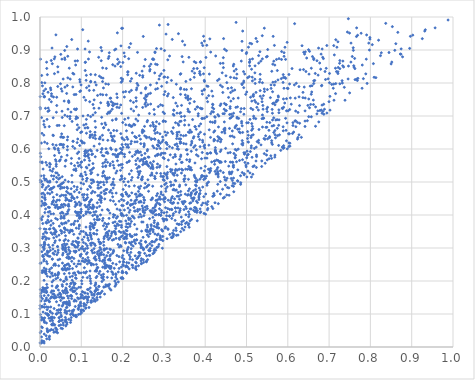
| Category | Series 0 |
|---|---|
| 0.1100741545748205 | 0.863 |
| 0.7561524050366171 | 0.88 |
| 0.2213383729348365 | 0.668 |
| 0.31082736364923436 | 0.566 |
| 0.05881501140073331 | 0.375 |
| 0.2077001341543867 | 0.469 |
| 0.09941343803983782 | 0.35 |
| 0.22474129590128156 | 0.241 |
| 0.0894987563862496 | 0.432 |
| 0.11428210081832157 | 0.461 |
| 0.32411420125168056 | 0.341 |
| 0.4494368115747863 | 0.602 |
| 0.09536818990439033 | 0.39 |
| 0.2600937671301935 | 0.419 |
| 0.07852395329659778 | 0.215 |
| 0.3941471520918871 | 0.913 |
| 0.3291404849244315 | 0.554 |
| 0.09436486856661941 | 0.665 |
| 0.2733584143950506 | 0.393 |
| 0.1052257160090927 | 0.147 |
| 0.02288861726060809 | 0.024 |
| 0.06707291813425464 | 0.637 |
| 0.3591070930105318 | 0.462 |
| 0.06666780943914763 | 0.155 |
| 0.06778112411339321 | 0.252 |
| 0.2748722158852226 | 0.562 |
| 0.3310838847310902 | 0.615 |
| 0.3318929965144153 | 0.457 |
| 0.2477126388382047 | 0.654 |
| 0.5381964580868404 | 0.943 |
| 0.17781520442138432 | 0.442 |
| 0.5909757921056853 | 0.892 |
| 0.7920201085679232 | 0.799 |
| 0.7385241480743844 | 0.748 |
| 0.11983235276188753 | 0.407 |
| 0.21065594822702782 | 0.352 |
| 0.060881231716892414 | 0.548 |
| 0.009716232876056385 | 0.758 |
| 0.31604654172249225 | 0.438 |
| 0.06135613150936381 | 0.09 |
| 0.1420657162447042 | 0.878 |
| 0.07551168304070432 | 0.48 |
| 0.2188223352079094 | 0.389 |
| 0.33605689649653636 | 0.672 |
| 0.14952287533325237 | 0.599 |
| 0.02309779512255772 | 0.033 |
| 0.8531947620428807 | 0.971 |
| 0.4792575335751018 | 0.502 |
| 0.3159996106679521 | 0.538 |
| 0.6005604851256033 | 0.783 |
| 0.47308720654351777 | 0.668 |
| 0.5228959210837767 | 0.935 |
| 0.4465650705564559 | 0.738 |
| 0.053762233356189126 | 0.124 |
| 0.07399551900357404 | 0.173 |
| 0.23739341022596705 | 0.514 |
| 0.568996805573417 | 0.582 |
| 0.01069423835793637 | 0.759 |
| 0.06035654664035961 | 0.235 |
| 0.17217413523768677 | 0.337 |
| 0.14523132341892298 | 0.317 |
| 0.49076377622362677 | 0.957 |
| 0.08273669467874911 | 0.765 |
| 0.015587371564667052 | 0.148 |
| 0.6525093754042111 | 0.725 |
| 0.04582628905373576 | 0.127 |
| 0.17189366761087765 | 0.245 |
| 0.06028367757846953 | 0.871 |
| 0.46297315807958483 | 0.528 |
| 0.5579046771576871 | 0.756 |
| 0.06540003005969464 | 0.074 |
| 0.36713405126202314 | 0.451 |
| 0.0478295696015727 | 0.08 |
| 0.07532882888513681 | 0.193 |
| 0.11683900330069885 | 0.262 |
| 0.4604868582226377 | 0.639 |
| 0.32355957938067237 | 0.353 |
| 0.6502463645707136 | 0.901 |
| 0.006479523693893263 | 0.395 |
| 0.16439020136098426 | 0.742 |
| 0.041366741785079375 | 0.111 |
| 0.2330998935594648 | 0.255 |
| 0.13855004535495663 | 0.143 |
| 0.1282840695632944 | 0.703 |
| 0.37411915965848697 | 0.423 |
| 0.5772220572884103 | 0.758 |
| 0.18890216964727313 | 0.311 |
| 0.38485767430715845 | 0.447 |
| 0.301617382544072 | 0.44 |
| 0.004858100457132419 | 0.168 |
| 0.23472706481705785 | 0.358 |
| 0.006480270601800675 | 0.086 |
| 0.1756989581873024 | 0.732 |
| 0.7900397834879348 | 0.872 |
| 0.3982229264601924 | 0.645 |
| 0.02855077183409871 | 0.069 |
| 0.06489286589899734 | 0.132 |
| 0.06345272307394045 | 0.376 |
| 0.37696562812458945 | 0.511 |
| 0.4523907403904154 | 0.801 |
| 0.5006412719442461 | 0.773 |
| 0.46800749968885136 | 0.851 |
| 0.03250328421970072 | 0.454 |
| 0.5161220097687583 | 0.643 |
| 0.1295572435642931 | 0.344 |
| 0.043669580052863255 | 0.286 |
| 0.27410458968183204 | 0.355 |
| 0.10637662016686822 | 0.757 |
| 0.6977144675577851 | 0.813 |
| 0.38653303928656646 | 0.629 |
| 0.19308721201018708 | 0.415 |
| 0.550347883560244 | 0.713 |
| 0.35058751373335584 | 0.915 |
| 0.06958736796798826 | 0.743 |
| 0.06937149974268386 | 0.302 |
| 0.4726577700699891 | 0.575 |
| 0.028739821413796163 | 0.434 |
| 0.06279326718668432 | 0.083 |
| 0.15408509092757916 | 0.664 |
| 0.265960096582158 | 0.352 |
| 0.0017444135159826457 | 0.577 |
| 0.36385474008297647 | 0.538 |
| 0.12134730296547214 | 0.339 |
| 0.4080440109054172 | 0.5 |
| 0.2106760058366166 | 0.292 |
| 0.2876465947639527 | 0.62 |
| 0.182821030131451 | 0.432 |
| 0.15362581361473993 | 0.499 |
| 0.0967094701959691 | 0.408 |
| 0.04469792743359702 | 0.596 |
| 0.37662139623100677 | 0.478 |
| 0.157498970892752 | 0.679 |
| 0.020537508802304316 | 0.488 |
| 0.712697496963027 | 0.885 |
| 0.23250698948425963 | 0.755 |
| 0.29457919484842243 | 0.356 |
| 0.6779533720498256 | 0.717 |
| 0.0036828761258113074 | 0.031 |
| 0.8745109953242072 | 0.903 |
| 0.004353847302404623 | 0.801 |
| 0.2888647622006305 | 0.434 |
| 0.040922162487327274 | 0.462 |
| 0.16441239013436637 | 0.587 |
| 0.24378213488791511 | 0.441 |
| 0.10947649951936478 | 0.838 |
| 0.25810704071102053 | 0.276 |
| 0.1115141281354779 | 0.425 |
| 0.008950573860700306 | 0.082 |
| 0.13293101221492976 | 0.169 |
| 0.0885428015474733 | 0.176 |
| 0.3319809298994284 | 0.639 |
| 0.35125574784215097 | 0.364 |
| 0.08949458157244639 | 0.434 |
| 0.23677791673108506 | 0.685 |
| 0.1780356338276572 | 0.509 |
| 0.762518998744183 | 0.844 |
| 0.6750677041381641 | 0.682 |
| 0.3761127106289186 | 0.721 |
| 0.08419635822444016 | 0.602 |
| 0.0868368542497231 | 0.691 |
| 0.09726463142179043 | 0.279 |
| 0.29703100353059797 | 0.351 |
| 0.21551195347099938 | 0.672 |
| 0.07234918369407883 | 0.463 |
| 0.30803865688706855 | 0.614 |
| 0.5967271826457968 | 0.625 |
| 0.1407700352191994 | 0.49 |
| 0.32258353494054615 | 0.574 |
| 0.6651730564934099 | 0.808 |
| 0.3517928914092684 | 0.764 |
| 0.1816602128645486 | 0.184 |
| 0.2296685080790556 | 0.583 |
| 0.09449974077980572 | 0.294 |
| 0.2766714069636026 | 0.366 |
| 0.004505472962964441 | 0.019 |
| 0.7112510562920555 | 0.797 |
| 0.053624582656293995 | 0.613 |
| 0.0429893669696344 | 0.217 |
| 0.12808767409357424 | 0.43 |
| 0.01732960971104147 | 0.278 |
| 0.16170496553257974 | 0.277 |
| 0.04151704353548846 | 0.183 |
| 0.7530878419614998 | 0.921 |
| 0.551112135616497 | 0.631 |
| 0.49864947625384093 | 0.551 |
| 0.34754329155292196 | 0.64 |
| 0.003740885011056183 | 0.464 |
| 0.7697729882105951 | 0.814 |
| 0.307345536864577 | 0.523 |
| 0.4756595513655947 | 0.672 |
| 0.24471708252873325 | 0.322 |
| 0.013563800192890607 | 0.781 |
| 0.6026672765176194 | 0.618 |
| 0.5631681289763388 | 0.774 |
| 0.23831258400169242 | 0.274 |
| 0.22681183460676424 | 0.715 |
| 0.436245949551351 | 0.732 |
| 0.12116682230491926 | 0.366 |
| 0.12511485793077903 | 0.421 |
| 0.12271605653081996 | 0.698 |
| 0.009386136792113198 | 0.685 |
| 0.5981010519724457 | 0.679 |
| 0.06481699195612278 | 0.19 |
| 0.06853239545998857 | 0.322 |
| 0.5741503546143323 | 0.689 |
| 0.13468688579390875 | 0.19 |
| 0.06333188737560558 | 0.402 |
| 0.051497954840776905 | 0.782 |
| 0.19606553814048733 | 0.912 |
| 0.16470394215265793 | 0.338 |
| 0.052513074315030384 | 0.351 |
| 0.4677422031651026 | 0.548 |
| 0.2717401302300192 | 0.319 |
| 0.03282528835269516 | 0.36 |
| 0.05003871738589727 | 0.141 |
| 0.37269681494846807 | 0.637 |
| 0.23623413791657166 | 0.595 |
| 0.2735065212190322 | 0.405 |
| 0.5042001215957855 | 0.68 |
| 0.10913676898128988 | 0.903 |
| 0.19640825114028349 | 0.334 |
| 0.46290792346199094 | 0.511 |
| 0.25923875335337354 | 0.427 |
| 0.07953143068511304 | 0.829 |
| 0.014846156111684383 | 0.034 |
| 0.2636741426281569 | 0.491 |
| 0.4239769158148209 | 0.532 |
| 0.017182885981332774 | 0.055 |
| 0.16563773481280175 | 0.373 |
| 0.06140904214902754 | 0.173 |
| 0.027201983603159285 | 0.868 |
| 0.3430625991278782 | 0.539 |
| 0.3828857282450634 | 0.579 |
| 0.0002288454370822368 | 0.012 |
| 0.05994901947746145 | 0.876 |
| 0.07684575884237377 | 0.154 |
| 0.03420333206057369 | 0.117 |
| 0.5202880348131336 | 0.812 |
| 0.061920203584229117 | 0.377 |
| 0.17486568743311948 | 0.626 |
| 0.41770728844451777 | 0.681 |
| 0.4781490764428097 | 0.728 |
| 0.3817742200452954 | 0.727 |
| 0.10736024236123909 | 0.291 |
| 0.131611777189108 | 0.386 |
| 0.44794720459118265 | 0.658 |
| 0.11576016820506119 | 0.33 |
| 0.18448345014136935 | 0.577 |
| 0.05481410435278289 | 0.279 |
| 0.13325980961978778 | 0.269 |
| 0.044963383678046864 | 0.509 |
| 0.06522228596865765 | 0.12 |
| 0.7960903821757862 | 0.921 |
| 0.22366046342711998 | 0.578 |
| 0.12365383205557201 | 0.507 |
| 0.18374912455762316 | 0.903 |
| 0.05149458832351217 | 0.151 |
| 0.38603867588358165 | 0.463 |
| 0.04349889925415884 | 0.423 |
| 0.5034660668223253 | 0.533 |
| 0.10824581693810087 | 0.592 |
| 0.7460311614944646 | 0.812 |
| 0.45522743165821833 | 0.588 |
| 0.3783571378190601 | 0.42 |
| 0.13032902753382858 | 0.409 |
| 0.0414854225537864 | 0.527 |
| 0.2974152038998784 | 0.389 |
| 0.5005398874218442 | 0.679 |
| 0.6627469821935159 | 0.871 |
| 0.33220132715919526 | 0.601 |
| 0.13809127377802166 | 0.386 |
| 0.40889133138435696 | 0.612 |
| 0.03105660466861704 | 0.16 |
| 0.2671863989159129 | 0.558 |
| 0.261247874868617 | 0.507 |
| 0.153531096465638 | 0.264 |
| 0.045213332667328854 | 0.222 |
| 0.11095327006446787 | 0.119 |
| 0.5639190679559897 | 0.802 |
| 0.28412710258379503 | 0.612 |
| 0.19269778702813123 | 0.586 |
| 0.15880554725636187 | 0.513 |
| 0.35524844966996894 | 0.377 |
| 0.14278984440684994 | 0.724 |
| 0.05233647672937014 | 0.637 |
| 0.060794783592021284 | 0.08 |
| 0.26304623115594705 | 0.335 |
| 0.12121815301932448 | 0.23 |
| 0.277858499911103 | 0.517 |
| 0.3422385064205339 | 0.698 |
| 0.10509330561178765 | 0.317 |
| 0.47587781021500175 | 0.561 |
| 0.7161088600685399 | 0.798 |
| 0.15951153847136545 | 0.567 |
| 0.2665099587690626 | 0.292 |
| 0.018547795295711045 | 0.466 |
| 0.20094631343780844 | 0.208 |
| 0.6869217931407494 | 0.736 |
| 0.37198042713566937 | 0.414 |
| 0.1569923957350321 | 0.56 |
| 0.07764097383129265 | 0.354 |
| 0.0541289176569254 | 0.082 |
| 0.28944384820635205 | 0.455 |
| 0.2821222905310572 | 0.904 |
| 0.03709940070072548 | 0.217 |
| 0.2529295693891016 | 0.572 |
| 0.2456632977831782 | 0.268 |
| 0.14263347261174308 | 0.277 |
| 0.11001982741993965 | 0.265 |
| 0.07112583732844768 | 0.11 |
| 0.44665782117122355 | 0.454 |
| 0.10381207270427173 | 0.269 |
| 0.06479689727542504 | 0.271 |
| 0.8198251337220566 | 0.93 |
| 0.7213368723338714 | 0.834 |
| 0.06661165681444559 | 0.699 |
| 0.07034592000960715 | 0.444 |
| 0.10603303641792006 | 0.673 |
| 0.0659892234547006 | 0.792 |
| 0.21915699871106686 | 0.429 |
| 0.14572451653514562 | 0.636 |
| 0.023806020817071838 | 0.499 |
| 0.1312014811508989 | 0.269 |
| 0.29700259370132565 | 0.732 |
| 0.47174092991278205 | 0.495 |
| 0.14510595266549564 | 0.312 |
| 0.27911375173457453 | 0.661 |
| 0.23331849903031743 | 0.635 |
| 0.07046332623262153 | 0.27 |
| 0.0756350987642268 | 0.371 |
| 0.21993780398068064 | 0.287 |
| 0.012081082703761847 | 0.506 |
| 0.5725892061892702 | 0.871 |
| 0.15713497360484208 | 0.297 |
| 0.36478108146967825 | 0.458 |
| 0.05624577393217178 | 0.134 |
| 0.04684353124764751 | 0.089 |
| 0.6569705984826502 | 0.845 |
| 0.49108126006336705 | 0.612 |
| 0.05366991972008517 | 0.372 |
| 0.15256186136695726 | 0.628 |
| 0.06935656479033714 | 0.274 |
| 0.17503995468639943 | 0.324 |
| 0.033815773649937264 | 0.358 |
| 0.1836256767965796 | 0.222 |
| 0.02263741684539522 | 0.75 |
| 0.34999137232050104 | 0.699 |
| 0.06976956473226603 | 0.741 |
| 0.039074844008831544 | 0.562 |
| 0.12522883897346837 | 0.528 |
| 0.07765550839167257 | 0.499 |
| 0.17278466646964885 | 0.599 |
| 0.48720490789893856 | 0.722 |
| 0.4244296863544267 | 0.595 |
| 0.22619068472923876 | 0.434 |
| 0.21917553181524696 | 0.336 |
| 0.09392675653732063 | 0.181 |
| 0.005446581545453744 | 0.231 |
| 0.18465397311519272 | 0.25 |
| 0.2447294316493147 | 0.261 |
| 0.17411153571982885 | 0.348 |
| 0.27775521646238266 | 0.831 |
| 0.7798534476119054 | 0.784 |
| 0.5302579960834105 | 0.659 |
| 0.39838075977109344 | 0.693 |
| 0.7254133776865678 | 0.86 |
| 0.18779279771144175 | 0.395 |
| 0.34090630311211867 | 0.828 |
| 0.15951875391514592 | 0.188 |
| 0.19857870074607897 | 0.225 |
| 0.11754417905471204 | 0.174 |
| 0.3753447646414806 | 0.41 |
| 0.5848610479898283 | 0.871 |
| 0.1686235480188264 | 0.469 |
| 0.2816395982158548 | 0.401 |
| 0.25103238890555934 | 0.453 |
| 0.037025970577972744 | 0.322 |
| 0.006961342333167031 | 0.767 |
| 0.19228959040283056 | 0.863 |
| 0.19628848033594137 | 0.305 |
| 0.1985381698207358 | 0.598 |
| 0.24998629702980235 | 0.562 |
| 0.48975886891213294 | 0.529 |
| 0.011606841351060715 | 0.334 |
| 0.21360796442581897 | 0.501 |
| 0.3323118166595015 | 0.521 |
| 0.26947705176378134 | 0.543 |
| 0.4724011035296456 | 0.573 |
| 0.2932093942930548 | 0.463 |
| 0.6930278385628218 | 0.844 |
| 0.08226165779343497 | 0.29 |
| 0.014773164910350078 | 0.223 |
| 0.040837523884774685 | 0.28 |
| 0.24253598867500958 | 0.402 |
| 0.3317737555625282 | 0.709 |
| 0.46917483937739013 | 0.857 |
| 0.12239048117113394 | 0.375 |
| 0.09530297065169047 | 0.398 |
| 0.451111287839173 | 0.734 |
| 0.26046590333698094 | 0.598 |
| 0.369470529663516 | 0.689 |
| 0.2919231322129804 | 0.734 |
| 0.169011615894338 | 0.297 |
| 0.030999074676923755 | 0.482 |
| 0.054410757220343164 | 0.254 |
| 0.267728536356711 | 0.52 |
| 0.212355798424823 | 0.362 |
| 0.08203013278158255 | 0.268 |
| 0.05612309771465751 | 0.425 |
| 0.08633676154198833 | 0.854 |
| 0.18629306908183785 | 0.206 |
| 0.20438006508676798 | 0.415 |
| 0.06492005781925803 | 0.911 |
| 0.03841962590829351 | 0.056 |
| 0.3383275528951758 | 0.708 |
| 0.02342546158810699 | 0.235 |
| 0.5046327879315242 | 0.621 |
| 0.1320402115037812 | 0.312 |
| 0.19799049554475057 | 0.509 |
| 0.19072249526777996 | 0.551 |
| 0.6189942723599008 | 0.685 |
| 0.1228160386434527 | 0.826 |
| 0.00765670082573211 | 0.175 |
| 0.15924876776378327 | 0.797 |
| 0.370207549149152 | 0.443 |
| 0.1228320955635982 | 0.805 |
| 0.27732409510307954 | 0.319 |
| 0.01349702974075584 | 0.418 |
| 0.2385936949042472 | 0.485 |
| 0.3094801793211671 | 0.359 |
| 0.17073209867238626 | 0.279 |
| 0.08971841584733609 | 0.398 |
| 0.21496216725078954 | 0.562 |
| 0.07661454514015209 | 0.147 |
| 0.44409033891438054 | 0.847 |
| 0.5370420723863024 | 0.564 |
| 0.1972553174107876 | 0.519 |
| 0.06631278108614413 | 0.597 |
| 0.20312546938423692 | 0.266 |
| 0.1286734546613577 | 0.368 |
| 0.2851072133269914 | 0.375 |
| 0.11947718956166786 | 0.777 |
| 0.18631741006069547 | 0.726 |
| 0.05333347777561459 | 0.715 |
| 0.6018907392313807 | 0.646 |
| 0.17177079270217144 | 0.241 |
| 0.7261090641455563 | 0.798 |
| 0.3939193236562474 | 0.485 |
| 0.03608175372473843 | 0.879 |
| 0.2206689494104177 | 0.721 |
| 0.12270853977553842 | 0.484 |
| 0.18810694178039922 | 0.576 |
| 0.350921606117669 | 0.51 |
| 0.1999130545318989 | 0.966 |
| 0.3810634142971525 | 0.413 |
| 0.4046190463038548 | 0.496 |
| 0.42103224286315677 | 0.624 |
| 0.35055199150893823 | 0.687 |
| 0.05975531682543522 | 0.358 |
| 0.06897501206532186 | 0.128 |
| 0.45030709411736114 | 0.822 |
| 0.4405448560379617 | 0.651 |
| 0.5119500137532038 | 0.515 |
| 0.01755907455954453 | 0.101 |
| 0.7022110170608604 | 0.718 |
| 0.511695118145562 | 0.61 |
| 0.1762713316810356 | 0.561 |
| 0.2778964497489258 | 0.423 |
| 0.6367793220179805 | 0.772 |
| 0.7497190854627658 | 0.77 |
| 0.2983039135765502 | 0.574 |
| 0.43551337930282763 | 0.559 |
| 0.07799376406533154 | 0.457 |
| 0.0071477935702188855 | 0.121 |
| 0.44375326797528847 | 0.529 |
| 0.5005476806607955 | 0.573 |
| 0.0591762246645251 | 0.348 |
| 0.039210935108962675 | 0.349 |
| 0.5002991186581397 | 0.893 |
| 0.2098901171345381 | 0.223 |
| 0.3026128377645845 | 0.36 |
| 0.272853650102882 | 0.487 |
| 0.08719144277241841 | 0.096 |
| 0.28280099572426876 | 0.302 |
| 0.03456284517605568 | 0.346 |
| 0.32473803527943 | 0.52 |
| 0.5376470932657437 | 0.743 |
| 0.16973085334809013 | 0.754 |
| 0.6734016740933456 | 0.824 |
| 0.20912368101548862 | 0.335 |
| 0.21236344785465944 | 0.629 |
| 0.15359989932610218 | 0.368 |
| 0.2282282340874705 | 0.391 |
| 0.32265697540379834 | 0.705 |
| 0.3187499768344535 | 0.451 |
| 0.05556699578002322 | 0.295 |
| 0.2388295426609538 | 0.547 |
| 0.46569382091266 | 0.655 |
| 0.4426607904473949 | 0.771 |
| 0.008007336213363692 | 0.231 |
| 0.508360886944527 | 0.92 |
| 0.08178149719101879 | 0.113 |
| 0.5138679569943835 | 0.818 |
| 0.2693934041855991 | 0.359 |
| 0.03364662661064155 | 0.045 |
| 0.6704648235020516 | 0.706 |
| 0.3480035619940779 | 0.616 |
| 0.006061824148834938 | 0.015 |
| 0.12607972943562384 | 0.373 |
| 0.5384346795833865 | 0.873 |
| 0.8450414274719726 | 0.892 |
| 0.20776939918810378 | 0.382 |
| 0.18375517031311006 | 0.527 |
| 0.09502520066436393 | 0.367 |
| 0.18453701676330891 | 0.366 |
| 0.8950217557644518 | 0.905 |
| 0.3024650029410001 | 0.453 |
| 0.4039935729847477 | 0.791 |
| 0.11742694907897555 | 0.323 |
| 0.23349596334388756 | 0.341 |
| 0.12157933423838674 | 0.179 |
| 0.055214151852808424 | 0.305 |
| 0.08818578865249127 | 0.244 |
| 0.280309522903078 | 0.293 |
| 0.3285415779164751 | 0.41 |
| 0.2584245956861344 | 0.76 |
| 0.2685354328808881 | 0.857 |
| 0.13930344810732975 | 0.288 |
| 0.5066052101483809 | 0.819 |
| 0.13028013258912163 | 0.778 |
| 0.07980435110789463 | 0.624 |
| 0.1520432990870333 | 0.764 |
| 0.3604128763207336 | 0.374 |
| 0.21289948072695208 | 0.834 |
| 0.016364639982488383 | 0.122 |
| 0.2304925622182633 | 0.276 |
| 0.039441839241605714 | 0.554 |
| 0.3619477102806167 | 0.562 |
| 0.40421309078660594 | 0.572 |
| 0.17694553666428348 | 0.377 |
| 0.3483552320986064 | 0.354 |
| 0.009536955733526753 | 0.178 |
| 0.2914038055756124 | 0.331 |
| 0.2735951615037726 | 0.42 |
| 0.09005390047473938 | 0.659 |
| 0.5471185035382068 | 0.666 |
| 0.22755442987154495 | 0.423 |
| 0.3042018834048624 | 0.364 |
| 0.36182808772012376 | 0.479 |
| 0.10505376150726842 | 0.398 |
| 0.46638155325971054 | 0.616 |
| 0.08707124988831894 | 0.765 |
| 0.19905418659674656 | 0.586 |
| 0.9026267437423124 | 0.945 |
| 0.27873417550228463 | 0.4 |
| 0.3976349367908243 | 0.846 |
| 0.24408775658643078 | 0.616 |
| 0.17474281545998904 | 0.466 |
| 0.11039130660916607 | 0.596 |
| 0.15492843784339672 | 0.492 |
| 0.38763148731732755 | 0.607 |
| 0.011824908730888817 | 0.437 |
| 0.13368035099707498 | 0.308 |
| 0.026238738435517273 | 0.369 |
| 0.2720891998862882 | 0.549 |
| 0.024013789859349655 | 0.274 |
| 0.20465649331818658 | 0.577 |
| 0.18409339990144258 | 0.689 |
| 0.7213461104044561 | 0.925 |
| 0.20309565745339797 | 0.444 |
| 0.29867074140251837 | 0.447 |
| 0.11518192266851357 | 0.453 |
| 0.1640498259898734 | 0.229 |
| 0.17099624335444163 | 0.603 |
| 0.03420507802812367 | 0.281 |
| 0.7009898598821939 | 0.801 |
| 0.07631451253843935 | 0.102 |
| 0.0948989808602273 | 0.439 |
| 0.0687583048642667 | 0.501 |
| 0.3634964272773683 | 0.419 |
| 0.476765050364263 | 0.827 |
| 0.44641495564242983 | 0.654 |
| 0.33307287231471594 | 0.608 |
| 0.12342863882175847 | 0.333 |
| 0.2780948026304515 | 0.511 |
| 0.0239697996933097 | 0.503 |
| 0.20144193744813776 | 0.478 |
| 0.010824800265701318 | 0.315 |
| 0.4590316798530807 | 0.525 |
| 0.022263484846513304 | 0.138 |
| 0.45123966299539353 | 0.716 |
| 0.26658770560625145 | 0.841 |
| 0.2084392240651448 | 0.226 |
| 0.29393921612863216 | 0.487 |
| 0.11617530920417518 | 0.702 |
| 0.17662161461148962 | 0.5 |
| 0.20241510129396945 | 0.398 |
| 0.12728108845891373 | 0.506 |
| 0.05891367960608451 | 0.222 |
| 0.2109669868750884 | 0.34 |
| 0.12194624710788537 | 0.314 |
| 0.11799549130162679 | 0.258 |
| 0.5015461748806977 | 0.593 |
| 0.13288941314515545 | 0.186 |
| 0.0496271467419418 | 0.48 |
| 0.12061728497171054 | 0.44 |
| 0.2571414313272459 | 0.56 |
| 0.3394060658597803 | 0.617 |
| 0.6671529990649658 | 0.669 |
| 0.15528223731034663 | 0.333 |
| 0.7213922376992067 | 0.829 |
| 0.4481609763564781 | 0.507 |
| 0.3214974390884867 | 0.647 |
| 0.03755731135845353 | 0.248 |
| 0.16528672492216268 | 0.732 |
| 0.6269820820545291 | 0.789 |
| 0.28753324590242635 | 0.401 |
| 0.21912458827864056 | 0.746 |
| 0.0032142277166684607 | 0.122 |
| 0.014488429095489308 | 0.326 |
| 0.3712430798146703 | 0.633 |
| 0.0037097832874838366 | 0.502 |
| 0.05878026916270829 | 0.245 |
| 0.0753291931428205 | 0.156 |
| 0.4468157687576627 | 0.902 |
| 0.2904161305125669 | 0.646 |
| 0.072001694248929 | 0.183 |
| 0.1329268271397095 | 0.641 |
| 0.33272574570162616 | 0.536 |
| 0.8967671629510696 | 0.941 |
| 0.10803287417298568 | 0.58 |
| 0.19862460751287914 | 0.403 |
| 0.6727571730196529 | 0.715 |
| 0.04670050122967395 | 0.078 |
| 0.19862712826001983 | 0.613 |
| 0.41843339292917814 | 0.457 |
| 0.1560901627534359 | 0.252 |
| 0.32397532431765896 | 0.478 |
| 0.04093463908722317 | 0.184 |
| 0.015002982892587502 | 0.236 |
| 0.017640928554685797 | 0.252 |
| 0.46777463325032453 | 0.496 |
| 0.2984382556088332 | 0.587 |
| 0.6424113680576362 | 0.894 |
| 0.26046389054781416 | 0.265 |
| 0.5758224393336652 | 0.748 |
| 0.1151129872360358 | 0.299 |
| 0.047816061177669233 | 0.163 |
| 0.30894055779876617 | 0.529 |
| 0.04752899671487243 | 0.49 |
| 0.17493947867835014 | 0.721 |
| 0.35032351073433754 | 0.519 |
| 0.03237754830830841 | 0.641 |
| 0.3760048969041496 | 0.463 |
| 0.05640765106963175 | 0.392 |
| 0.41601682888860725 | 0.775 |
| 0.2065877369463872 | 0.317 |
| 0.06781249788676502 | 0.131 |
| 0.09937896733739404 | 0.559 |
| 0.06446834309550986 | 0.129 |
| 0.40973403465675373 | 0.658 |
| 0.5889881054253623 | 0.825 |
| 0.07115528874957044 | 0.134 |
| 0.35874567162474125 | 0.714 |
| 0.11679863082772768 | 0.927 |
| 0.08239592880061863 | 0.188 |
| 0.4058460369168927 | 0.586 |
| 0.2076343424428332 | 0.243 |
| 0.5293810072720788 | 0.626 |
| 0.08764114530198042 | 0.432 |
| 0.1145208990089972 | 0.21 |
| 0.5896066105807218 | 0.817 |
| 0.19852520699939857 | 0.634 |
| 0.6344795230474017 | 0.913 |
| 0.0008494192323126315 | 0.721 |
| 0.23854938447235696 | 0.246 |
| 0.26129763630861835 | 0.734 |
| 0.08636099495540805 | 0.32 |
| 0.29760849707132286 | 0.322 |
| 0.5186256083586105 | 0.549 |
| 0.31428019861431045 | 0.341 |
| 0.02248178509745924 | 0.668 |
| 0.048382520915236316 | 0.512 |
| 0.766679061300919 | 0.967 |
| 0.4293370300709669 | 0.472 |
| 0.31012221651892113 | 0.977 |
| 0.162173419925697 | 0.247 |
| 0.3026490392814972 | 0.587 |
| 0.3426850566818461 | 0.732 |
| 0.25125117745272774 | 0.297 |
| 0.1975512778377998 | 0.708 |
| 0.5482149847846426 | 0.879 |
| 0.6817202784297544 | 0.792 |
| 0.2665472483692687 | 0.413 |
| 0.1842089397294695 | 0.329 |
| 0.3104098839878294 | 0.445 |
| 0.48488841872405497 | 0.649 |
| 0.25154510312972944 | 0.607 |
| 0.5931167820688079 | 0.908 |
| 0.10014683377975953 | 0.11 |
| 0.4530777172636532 | 0.511 |
| 0.2344363057382437 | 0.785 |
| 0.5958131238510168 | 0.657 |
| 0.05740829359206212 | 0.635 |
| 0.1165269937130965 | 0.58 |
| 0.2697542165217529 | 0.357 |
| 0.6386183017100437 | 0.893 |
| 0.25300448368014294 | 0.754 |
| 0.14341067097657823 | 0.269 |
| 0.025966951465642873 | 0.087 |
| 0.5929692886551607 | 0.817 |
| 0.35716531636458804 | 0.538 |
| 0.005724323934753195 | 0.059 |
| 0.4696835809435188 | 0.586 |
| 0.8664035237631265 | 0.953 |
| 0.16649588103124646 | 0.735 |
| 0.0680114581004796 | 0.13 |
| 0.39233241279341713 | 0.776 |
| 0.470145096172089 | 0.636 |
| 0.03382810188423846 | 0.518 |
| 0.19744372603837668 | 0.208 |
| 0.5484898709937606 | 0.582 |
| 0.04790282344527097 | 0.266 |
| 0.5713515986362045 | 0.742 |
| 0.03117592747382647 | 0.308 |
| 0.21061791527674367 | 0.434 |
| 0.06149810370780573 | 0.291 |
| 0.5630825564695265 | 0.688 |
| 0.009287265882333195 | 0.081 |
| 0.4607954799644619 | 0.56 |
| 0.20068375315023113 | 0.862 |
| 0.24452780206234526 | 0.301 |
| 0.8502061810240755 | 0.858 |
| 0.0851135805289216 | 0.426 |
| 0.4017790214695971 | 0.877 |
| 0.2402421188205457 | 0.64 |
| 0.05606128364052787 | 0.302 |
| 0.33775141233008754 | 0.448 |
| 0.42064346227060967 | 0.722 |
| 0.49666359609828103 | 0.588 |
| 0.3599438282563896 | 0.395 |
| 0.38872711973954355 | 0.865 |
| 0.3851004274203911 | 0.67 |
| 0.4156722912697971 | 0.561 |
| 0.24791341793348243 | 0.516 |
| 0.2990380417662054 | 0.686 |
| 0.24879952994651644 | 0.818 |
| 0.47991946862227364 | 0.754 |
| 0.23610259105331854 | 0.893 |
| 0.0466899133902936 | 0.151 |
| 0.02968608492039415 | 0.267 |
| 0.010235473704145348 | 0.299 |
| 0.3571047756143716 | 0.46 |
| 0.5635953223484897 | 0.857 |
| 0.44165628517126665 | 0.788 |
| 0.26729979907082757 | 0.794 |
| 0.09944179510784912 | 0.794 |
| 0.3281888260082425 | 0.68 |
| 0.21195561495584603 | 0.297 |
| 0.2561489909745934 | 0.318 |
| 0.05313560879019885 | 0.872 |
| 0.7908513967836414 | 0.946 |
| 0.6829930331157781 | 0.708 |
| 0.28418389310560144 | 0.581 |
| 0.1478254561698199 | 0.438 |
| 0.31000910714653895 | 0.356 |
| 0.009286028355143361 | 0.642 |
| 0.09170488255019837 | 0.331 |
| 0.11499945179136806 | 0.665 |
| 0.11472178308462222 | 0.579 |
| 0.17991663492339827 | 0.491 |
| 0.541005045130744 | 0.694 |
| 0.16290081821327995 | 0.333 |
| 0.5559786701950316 | 0.637 |
| 0.22851789603889416 | 0.489 |
| 0.2106533006537421 | 0.606 |
| 0.25546245455138783 | 0.782 |
| 0.2764945400261982 | 0.377 |
| 0.5210401494354214 | 0.799 |
| 0.04620308940206663 | 0.672 |
| 0.3751077248378286 | 0.668 |
| 0.7989340193278179 | 0.933 |
| 0.10894866877121256 | 0.586 |
| 0.07249569984585558 | 0.35 |
| 0.246458283392467 | 0.379 |
| 0.36337119341310264 | 0.657 |
| 0.15482252649873185 | 0.182 |
| 0.23926448134069445 | 0.394 |
| 0.31907701153696943 | 0.39 |
| 0.04206938816038008 | 0.185 |
| 0.2364862724165654 | 0.411 |
| 0.12179858482228034 | 0.535 |
| 0.3080692847466857 | 0.511 |
| 0.04655136226228562 | 0.589 |
| 0.3667674784775615 | 0.651 |
| 0.3580275105109273 | 0.721 |
| 0.04505209854724246 | 0.521 |
| 0.43178466685284644 | 0.434 |
| 0.48573465569353647 | 0.493 |
| 0.31917814790716625 | 0.416 |
| 0.0962225474215107 | 0.81 |
| 0.2579480850986814 | 0.303 |
| 0.4432067898215477 | 0.86 |
| 0.35307067186290964 | 0.491 |
| 0.01960468709599006 | 0.099 |
| 0.5787680617352378 | 0.874 |
| 0.061260790574262036 | 0.295 |
| 0.5731606104708713 | 0.745 |
| 0.5767470961926031 | 0.761 |
| 0.6829101055068161 | 0.733 |
| 0.19659386340417084 | 0.814 |
| 0.1673327423134553 | 0.39 |
| 0.23744506605633575 | 0.793 |
| 0.3356328625646924 | 0.371 |
| 0.10744698647726636 | 0.24 |
| 0.027973242496056372 | 0.24 |
| 0.47158424873355276 | 0.779 |
| 0.20958403944461124 | 0.399 |
| 0.14903142238465972 | 0.287 |
| 0.08899200027805654 | 0.477 |
| 0.027769520758882726 | 0.152 |
| 0.03457387138216561 | 0.873 |
| 0.5207147977959534 | 0.852 |
| 0.16288276266555468 | 0.513 |
| 0.21780938288096763 | 0.266 |
| 0.10099232928023039 | 0.561 |
| 0.31601783977855835 | 0.5 |
| 0.05058178824388093 | 0.39 |
| 0.3653032173091664 | 0.437 |
| 0.23255297271884257 | 0.244 |
| 0.34411664263666786 | 0.44 |
| 0.6822565768718559 | 0.793 |
| 0.07951303274990862 | 0.168 |
| 0.1282534178018393 | 0.556 |
| 0.3666738217653046 | 0.783 |
| 0.12313777372107504 | 0.136 |
| 0.043681553757937364 | 0.264 |
| 0.33416069086477596 | 0.339 |
| 0.16167165235173042 | 0.298 |
| 0.3939428506447189 | 0.692 |
| 0.5415030897690771 | 0.693 |
| 0.042550126023564006 | 0.043 |
| 0.14772683114543672 | 0.444 |
| 0.7976534232709224 | 0.9 |
| 0.11423121902060673 | 0.511 |
| 0.6050883123491166 | 0.618 |
| 0.02267586667128685 | 0.357 |
| 0.2753353493931321 | 0.668 |
| 0.1816760785904472 | 0.379 |
| 0.05073036293498834 | 0.614 |
| 0.08332505401249035 | 0.471 |
| 0.6407132642170198 | 0.888 |
| 0.7690414860906251 | 0.945 |
| 0.6173731872268883 | 0.685 |
| 0.08694533767944412 | 0.719 |
| 0.017838404610493463 | 0.825 |
| 0.2083656460773995 | 0.364 |
| 0.069355949385842 | 0.746 |
| 0.2548774932876521 | 0.496 |
| 0.3621100418972544 | 0.539 |
| 0.37652592905559257 | 0.491 |
| 0.5250879658749591 | 0.726 |
| 0.2799774535215296 | 0.428 |
| 0.020503153345980518 | 0.309 |
| 0.4599403012041733 | 0.693 |
| 0.2842406928316953 | 0.446 |
| 0.17594673260478633 | 0.455 |
| 0.3911026159365525 | 0.57 |
| 0.5909841262424711 | 0.881 |
| 0.13399118549797417 | 0.825 |
| 0.1027241280261516 | 0.619 |
| 0.777560655750454 | 0.951 |
| 0.5239076171071871 | 0.544 |
| 0.016122138751687665 | 0.375 |
| 9.008500004059616e-05 | 0.116 |
| 0.590734301319884 | 0.784 |
| 0.02353374727276769 | 0.302 |
| 0.5829576244216883 | 0.596 |
| 0.36335839478694176 | 0.382 |
| 0.04705442311233077 | 0.564 |
| 0.7829882713395405 | 0.813 |
| 0.3231623744325177 | 0.404 |
| 0.03258023433795809 | 0.758 |
| 0.17292453669682117 | 0.492 |
| 0.07377603674399369 | 0.098 |
| 0.05232531967602094 | 0.08 |
| 0.5907029406079101 | 0.604 |
| 0.08262544197690835 | 0.487 |
| 0.5258537785145213 | 0.622 |
| 0.23886235496418406 | 0.703 |
| 0.37747258185898025 | 0.862 |
| 0.11225096022652759 | 0.823 |
| 0.46156948564324674 | 0.771 |
| 0.09328568372879764 | 0.099 |
| 0.27422976469530624 | 0.674 |
| 0.22632233816379732 | 0.741 |
| 0.11730178437403871 | 0.873 |
| 0.4337683961388302 | 0.812 |
| 0.030940299418052986 | 0.216 |
| 0.20272554363556639 | 0.501 |
| 0.15697254759250578 | 0.244 |
| 0.5375456994798482 | 0.692 |
| 0.1453183024544441 | 0.631 |
| 0.517602721388831 | 0.693 |
| 0.009421369083785103 | 0.674 |
| 0.2957142364840667 | 0.622 |
| 0.27142706566303654 | 0.521 |
| 0.11895228884026754 | 0.262 |
| 0.0026015784615920357 | 0.389 |
| 0.04490113753072811 | 0.104 |
| 0.11205521230696713 | 0.545 |
| 0.03923933935966528 | 0.548 |
| 0.5968999032031846 | 0.716 |
| 0.018837404184973483 | 0.096 |
| 0.04589861931500139 | 0.339 |
| 0.35916948615071165 | 0.37 |
| 0.33907119346513614 | 0.413 |
| 0.13546224128212236 | 0.41 |
| 0.6873838184811882 | 0.705 |
| 0.3773945725697373 | 0.414 |
| 0.5084607848160199 | 0.69 |
| 0.08180834309177809 | 0.537 |
| 0.20019666447894624 | 0.277 |
| 0.5169200708200683 | 0.766 |
| 0.1627486001196411 | 0.348 |
| 0.2092975419053874 | 0.247 |
| 0.05642501291633162 | 0.605 |
| 0.1990029401689195 | 0.553 |
| 0.1401171046986145 | 0.522 |
| 0.1165953861194412 | 0.595 |
| 0.22260634361776477 | 0.248 |
| 0.020127064887879742 | 0.396 |
| 0.2031746648894831 | 0.345 |
| 0.1658009778977091 | 0.711 |
| 0.05909564460325867 | 0.313 |
| 0.17753838278680056 | 0.394 |
| 0.28635015149263365 | 0.304 |
| 0.3403054021275692 | 0.766 |
| 0.519656278648738 | 0.747 |
| 0.56758292469267 | 0.914 |
| 0.5150560781518029 | 0.662 |
| 0.12210910118867302 | 0.356 |
| 0.3185586414865239 | 0.491 |
| 0.4956730328597897 | 0.827 |
| 0.050074458167364444 | 0.153 |
| 0.2296054605642035 | 0.673 |
| 0.6570057099052995 | 0.698 |
| 0.0602568614436334 | 0.703 |
| 0.16062331921917838 | 0.844 |
| 0.6045954654583825 | 0.72 |
| 0.015960802153271003 | 0.863 |
| 0.3072454531167268 | 0.547 |
| 0.2519838034805161 | 0.851 |
| 0.08401556217774597 | 0.225 |
| 0.09123654334815934 | 0.382 |
| 0.1244114087239111 | 0.136 |
| 0.30402399463099505 | 0.683 |
| 0.6246684910809102 | 0.711 |
| 0.6902232852645687 | 0.835 |
| 0.42263682724573215 | 0.563 |
| 0.28387344128552827 | 0.371 |
| 0.22891916307726234 | 0.412 |
| 0.05104077778934235 | 0.057 |
| 0.09959651925051882 | 0.224 |
| 0.5099086862565215 | 0.757 |
| 0.24465153598462774 | 0.312 |
| 0.12519759557764532 | 0.292 |
| 0.1600604640356984 | 0.345 |
| 0.13880261262338833 | 0.394 |
| 0.05389004069094605 | 0.695 |
| 0.623221024831191 | 0.681 |
| 0.7153512827191538 | 0.845 |
| 0.0900159346555669 | 0.302 |
| 0.10659389290941867 | 0.446 |
| 0.5142038819802905 | 0.669 |
| 0.38674005756727414 | 0.835 |
| 0.22138959965619642 | 0.623 |
| 0.2919549702657688 | 0.448 |
| 0.05266233272258747 | 0.431 |
| 0.2485802969452766 | 0.301 |
| 0.07567013877492335 | 0.444 |
| 0.3135041719247219 | 0.397 |
| 0.032725742778230704 | 0.404 |
| 0.6366667621906541 | 0.756 |
| 0.18504708038443918 | 0.39 |
| 0.30500796972707966 | 0.642 |
| 0.7618554353892989 | 0.874 |
| 0.23211916820684186 | 0.592 |
| 0.13802425511995642 | 0.238 |
| 0.1539900995165394 | 0.532 |
| 0.024695001484973056 | 0.212 |
| 0.12113773213551526 | 0.423 |
| 0.10503884058140223 | 0.453 |
| 0.25457393244741655 | 0.571 |
| 0.18734325552891806 | 0.952 |
| 0.181701101321329 | 0.851 |
| 0.12182566179173393 | 0.638 |
| 0.45657349020217697 | 0.756 |
| 0.5042249698940116 | 0.584 |
| 0.2074439895803396 | 0.774 |
| 0.33972927721782364 | 0.622 |
| 0.4421200246091528 | 0.478 |
| 0.020098264848030234 | 0.157 |
| 0.10893474344737808 | 0.445 |
| 0.09391647761389221 | 0.126 |
| 0.29337512254867537 | 0.325 |
| 0.8133320783421635 | 0.816 |
| 0.14700847237445136 | 0.282 |
| 0.19986972991091823 | 0.812 |
| 0.06112649251235913 | 0.307 |
| 0.5946320086220737 | 0.693 |
| 0.09401032099075923 | 0.399 |
| 0.011314344592757375 | 0.12 |
| 0.4389752839953335 | 0.629 |
| 0.07796820001265459 | 0.11 |
| 0.014818663027496681 | 0.508 |
| 0.21869641311835064 | 0.431 |
| 0.3788946607006888 | 0.442 |
| 0.0847683796350569 | 0.305 |
| 0.0992144440734738 | 0.159 |
| 0.08180995833853033 | 0.341 |
| 0.06441784883074286 | 0.101 |
| 0.257931273409983 | 0.634 |
| 0.2844993845017877 | 0.465 |
| 0.04394760290939481 | 0.601 |
| 0.2596285745867769 | 0.554 |
| 0.5784219022230827 | 0.719 |
| 0.21590497462931746 | 0.908 |
| 0.11454170886880433 | 0.286 |
| 0.24653877231172638 | 0.46 |
| 0.6114747228285319 | 0.647 |
| 0.18071085500076056 | 0.9 |
| 0.46850727513104196 | 0.487 |
| 0.21473157234339102 | 0.874 |
| 0.3205285938016865 | 0.456 |
| 0.2157994140583004 | 0.487 |
| 0.14585819234461572 | 0.151 |
| 0.14754908242900955 | 0.908 |
| 0.1626801391833811 | 0.591 |
| 0.34500217222749374 | 0.927 |
| 0.20846537877982252 | 0.353 |
| 0.39659962632495904 | 0.456 |
| 0.5925697426204064 | 0.739 |
| 0.061843611718964464 | 0.337 |
| 0.11668401455002375 | 0.151 |
| 0.00996002828230047 | 0.266 |
| 0.05529339902105512 | 0.635 |
| 0.09409636419348966 | 0.317 |
| 0.21638295439932742 | 0.564 |
| 0.233462208208029 | 0.779 |
| 0.05143105239074197 | 0.396 |
| 0.27694664239014255 | 0.631 |
| 0.3532059843132407 | 0.805 |
| 0.30955343866187623 | 0.419 |
| 0.6567557941433865 | 0.766 |
| 0.002821029308950118 | 0.255 |
| 0.3544214602557889 | 0.598 |
| 0.0005412835567026875 | 0.759 |
| 0.08040061248937858 | 0.098 |
| 0.17800529027207956 | 0.293 |
| 0.1356667709310626 | 0.232 |
| 0.17648563368775005 | 0.739 |
| 0.5945710356212983 | 0.872 |
| 0.1635309600645959 | 0.56 |
| 0.4223879151799339 | 0.563 |
| 0.6061612546298358 | 0.755 |
| 0.003050832645384749 | 0.082 |
| 0.14761841591807578 | 0.456 |
| 0.27084516026250594 | 0.413 |
| 0.3889863111652796 | 0.676 |
| 0.3829802799754516 | 0.7 |
| 0.362535637022376 | 0.739 |
| 0.37929765039545227 | 0.5 |
| 0.43715962863767355 | 0.622 |
| 0.29684877233222484 | 0.636 |
| 0.33867532489901 | 0.683 |
| 0.11151194812692744 | 0.41 |
| 0.14364730922883517 | 0.387 |
| 0.25528765866891046 | 0.415 |
| 0.12774679379592002 | 0.398 |
| 0.05023691861704327 | 0.636 |
| 0.062382680713404914 | 0.076 |
| 0.43642184731832223 | 0.501 |
| 0.2628810578006666 | 0.472 |
| 0.14527756993775198 | 0.283 |
| 0.0033512792030021554 | 0.618 |
| 0.14931612576973807 | 0.696 |
| 0.1598536877541511 | 0.601 |
| 0.5202905729561323 | 0.831 |
| 0.603781765790765 | 0.646 |
| 0.2578712709245147 | 0.562 |
| 0.1548141009146219 | 0.579 |
| 0.2365326559726152 | 0.591 |
| 0.07680683423685153 | 0.26 |
| 0.06617922470288273 | 0.627 |
| 0.025032625722973267 | 0.553 |
| 0.018729228874015957 | 0.384 |
| 0.33021991125358807 | 0.476 |
| 0.7178843661964466 | 0.835 |
| 0.17790003095486073 | 0.401 |
| 0.011323353707310746 | 0.45 |
| 0.11507390930472317 | 0.338 |
| 0.11144534325305944 | 0.152 |
| 0.41859083791842755 | 0.734 |
| 0.029300831353242462 | 0.224 |
| 0.08211703880987709 | 0.827 |
| 0.8740446521500789 | 0.887 |
| 0.009224414202599451 | 0.776 |
| 0.18123258593109337 | 0.399 |
| 0.431537594765938 | 0.516 |
| 0.0212629111975835 | 0.378 |
| 0.31993477830767514 | 0.331 |
| 0.006728978922465156 | 0.275 |
| 0.39258696898095025 | 0.722 |
| 0.6811665916505888 | 0.718 |
| 0.3271401265110291 | 0.475 |
| 0.0668443583145435 | 0.404 |
| 0.025032436733830488 | 0.293 |
| 0.11437673746196209 | 0.307 |
| 0.5166019253247415 | 0.76 |
| 0.098305377551276 | 0.776 |
| 0.009316225584604765 | 0.311 |
| 0.6851149564880237 | 0.714 |
| 0.08625531710342516 | 0.093 |
| 0.015561391382431733 | 0.073 |
| 0.5430142487160325 | 0.782 |
| 0.7466514840038239 | 0.995 |
| 0.12266455261528009 | 0.803 |
| 0.42610286181825907 | 0.524 |
| 0.2101102154955531 | 0.329 |
| 0.7321702974210677 | 0.8 |
| 0.30763113534046604 | 0.328 |
| 0.010094015407506096 | 0.239 |
| 0.029302503148802006 | 0.185 |
| 0.72600013612965 | 0.843 |
| 0.22104543052163605 | 0.506 |
| 0.19617461364355382 | 0.21 |
| 0.26457518169986427 | 0.291 |
| 0.03140267778688188 | 0.642 |
| 0.30855367110944965 | 0.761 |
| 0.1536361521360744 | 0.221 |
| 0.12353294834243012 | 0.445 |
| 0.42321829380196874 | 0.68 |
| 0.19427191840921287 | 0.507 |
| 0.10346455759901063 | 0.962 |
| 0.2336399045427684 | 0.589 |
| 0.5350926732984415 | 0.612 |
| 0.19488885275818768 | 0.602 |
| 0.16545646114638313 | 0.874 |
| 0.3938279646758144 | 0.519 |
| 0.30519135087661153 | 0.948 |
| 0.27853330684776145 | 0.892 |
| 0.19494037368389527 | 0.535 |
| 0.03940548063297711 | 0.179 |
| 0.41860169015000936 | 0.42 |
| 0.2496398727158733 | 0.568 |
| 0.09964555128741703 | 0.113 |
| 0.4388840423519188 | 0.56 |
| 0.023693777533474236 | 0.411 |
| 0.3440579669769035 | 0.88 |
| 0.1832938649784669 | 0.359 |
| 0.1435217154653129 | 0.631 |
| 0.13783388502925664 | 0.214 |
| 0.19168349515348904 | 0.442 |
| 0.0587390953807041 | 0.361 |
| 0.1468888428934827 | 0.454 |
| 0.3015876520207905 | 0.898 |
| 0.017669259745560773 | 0.29 |
| 0.5984131737514539 | 0.923 |
| 0.11554064264929464 | 0.161 |
| 0.28807844381901415 | 0.311 |
| 0.034945120293471965 | 0.251 |
| 0.02280400185480491 | 0.229 |
| 0.18155635650657864 | 0.583 |
| 0.05457412896592817 | 0.237 |
| 0.15394634656902995 | 0.204 |
| 0.01890246180546218 | 0.098 |
| 0.014490916525750963 | 0.432 |
| 0.061925543359164115 | 0.301 |
| 0.007602227723506605 | 0.017 |
| 0.3721577903177906 | 0.605 |
| 0.05000239867515033 | 0.114 |
| 0.13655019530260581 | 0.25 |
| 0.29735691234038664 | 0.335 |
| 0.3221314497193132 | 0.476 |
| 0.25492919405055214 | 0.424 |
| 0.4621320635289047 | 0.745 |
| 0.021847084916922332 | 0.087 |
| 0.03195046355606457 | 0.052 |
| 0.005953948458255476 | 0.791 |
| 0.22294259986382403 | 0.432 |
| 0.21798553257763864 | 0.366 |
| 0.01642415601683822 | 0.19 |
| 0.00636315179622815 | 0.329 |
| 0.15515279934349258 | 0.297 |
| 0.378675690853839 | 0.598 |
| 0.46538104760096477 | 0.56 |
| 0.31673625774603065 | 0.531 |
| 0.41039239439704056 | 0.528 |
| 0.23908421313321815 | 0.458 |
| 0.4437090822252502 | 0.451 |
| 0.010920430470828135 | 0.758 |
| 0.2823756371295669 | 0.527 |
| 0.3202406046825532 | 0.932 |
| 0.4244666248572635 | 0.597 |
| 0.15100770472238823 | 0.26 |
| 0.0037724027230274793 | 0.695 |
| 0.16054765801742799 | 0.248 |
| 0.3712202344931431 | 0.447 |
| 0.5152820229710118 | 0.719 |
| 0.11209741111983396 | 0.448 |
| 0.1055415293495795 | 0.494 |
| 0.03314002764124635 | 0.17 |
| 0.542546689962858 | 0.632 |
| 0.08472501937430965 | 0.381 |
| 0.23412788691693043 | 0.455 |
| 0.1588832991993686 | 0.547 |
| 0.5385488437898558 | 0.801 |
| 0.04960374309631954 | 0.798 |
| 0.5710698616489083 | 0.688 |
| 0.16301907211614175 | 0.509 |
| 0.2832412012102433 | 0.544 |
| 0.2255471058155878 | 0.306 |
| 0.22316450395655396 | 0.514 |
| 0.39810709010327583 | 0.927 |
| 0.29348234275630747 | 0.828 |
| 0.38769537129269027 | 0.418 |
| 0.26178466344210194 | 0.551 |
| 0.14086314896237506 | 0.162 |
| 0.15465355839435269 | 0.181 |
| 0.366374306063866 | 0.468 |
| 0.17856493933443884 | 0.326 |
| 0.18670054278663162 | 0.418 |
| 0.27258421550511447 | 0.872 |
| 0.4894223089038645 | 0.795 |
| 0.6102842619122356 | 0.844 |
| 0.4503848414507561 | 0.505 |
| 0.05554486186007923 | 0.234 |
| 0.34928557962157225 | 0.781 |
| 0.07129927819730442 | 0.284 |
| 0.12156189874248768 | 0.653 |
| 0.3093763211727406 | 0.87 |
| 0.45510514889569587 | 0.784 |
| 0.3569914364598914 | 0.584 |
| 0.05976134374725772 | 0.36 |
| 0.05711132838932664 | 0.613 |
| 0.11950526289703634 | 0.432 |
| 0.7101292010313498 | 0.784 |
| 0.05686523451387826 | 0.199 |
| 0.549313364339463 | 0.666 |
| 0.13303537578628544 | 0.642 |
| 0.1602736122896583 | 0.589 |
| 0.0650029290858607 | 0.17 |
| 0.17859896182239765 | 0.656 |
| 0.20087300863042634 | 0.226 |
| 0.04768262445053084 | 0.423 |
| 0.006389953767023782 | 0.088 |
| 0.310822289889093 | 0.767 |
| 0.11073414873812049 | 0.117 |
| 0.1812967704610785 | 0.367 |
| 0.03456957463004651 | 0.149 |
| 0.24444243644437091 | 0.439 |
| 0.46848156772348704 | 0.551 |
| 0.03858701156430899 | 0.44 |
| 0.12518583889049895 | 0.252 |
| 0.0068682065954130955 | 0.278 |
| 0.3684263345072485 | 0.836 |
| 0.16553163115302372 | 0.243 |
| 0.05663310197701521 | 0.498 |
| 0.05856156511406296 | 0.483 |
| 0.09343693726546898 | 0.146 |
| 0.42282219651628206 | 0.554 |
| 0.08588357494125887 | 0.41 |
| 0.5447202936389961 | 0.629 |
| 0.154059940868305 | 0.319 |
| 0.03709606761887996 | 0.423 |
| 0.3832871012056681 | 0.707 |
| 0.06920774024837328 | 0.433 |
| 0.10970590597033969 | 0.578 |
| 0.06925069372788129 | 0.236 |
| 0.06279083247815287 | 0.207 |
| 0.6542789768200452 | 0.791 |
| 0.6457120049107286 | 0.876 |
| 0.4873720645032077 | 0.866 |
| 0.028876393354004937 | 0.17 |
| 0.46543986260550796 | 0.489 |
| 0.21644644636522048 | 0.773 |
| 0.06902847621049624 | 0.382 |
| 0.3059355425851037 | 0.387 |
| 0.13334230603872088 | 0.684 |
| 0.000656621838975191 | 0.043 |
| 0.07741863381952707 | 0.272 |
| 0.8591312580730638 | 0.899 |
| 0.18347441098990946 | 0.212 |
| 0.07416982361554658 | 0.192 |
| 0.00824657101307491 | 0.343 |
| 0.08001029444689689 | 0.32 |
| 0.11137205529808669 | 0.363 |
| 0.0697965003328479 | 0.416 |
| 0.21175716614317652 | 0.286 |
| 0.33225403150663557 | 0.644 |
| 0.2760009489990287 | 0.41 |
| 0.3736167827281366 | 0.865 |
| 0.24837917796980657 | 0.658 |
| 0.21997150074373772 | 0.616 |
| 0.12454320673560415 | 0.594 |
| 0.007429640456531161 | 0.106 |
| 0.14950689568090614 | 0.898 |
| 0.009812365843787418 | 0.305 |
| 0.12873097926142807 | 0.635 |
| 0.29831181409862606 | 0.46 |
| 0.8243670849280671 | 0.883 |
| 0.30762794021337636 | 0.515 |
| 0.10237745800090381 | 0.517 |
| 0.002760021663182566 | 0.012 |
| 0.02988720974323411 | 0.266 |
| 0.20716107712322562 | 0.49 |
| 0.34100593335944085 | 0.582 |
| 0.040151830259075316 | 0.335 |
| 0.5035117444543025 | 0.557 |
| 0.2847842426197731 | 0.783 |
| 0.5387321889432598 | 0.667 |
| 0.18147520630357894 | 0.347 |
| 0.10298747155762089 | 0.461 |
| 0.11190918598555954 | 0.341 |
| 0.1535966327439584 | 0.785 |
| 0.1218797614623558 | 0.597 |
| 0.012905210056447958 | 0.178 |
| 0.6083454044912515 | 0.736 |
| 0.2943452005903674 | 0.408 |
| 0.045247795180801464 | 0.246 |
| 0.2489470182088559 | 0.42 |
| 0.5850289317472457 | 0.895 |
| 0.09408748310168069 | 0.359 |
| 0.395931463419702 | 0.828 |
| 0.7468993442700262 | 0.851 |
| 0.08501077574780647 | 0.192 |
| 0.2822284419278993 | 0.459 |
| 0.09252640802628698 | 0.308 |
| 0.11281426991955168 | 0.786 |
| 0.586399222974429 | 0.724 |
| 0.25267974759431244 | 0.612 |
| 0.07792167649873949 | 0.202 |
| 0.13349092604113932 | 0.23 |
| 0.10517702036550891 | 0.149 |
| 0.24371528594047775 | 0.487 |
| 0.3004057397763259 | 0.45 |
| 0.13299764290317762 | 0.401 |
| 0.002833809361788231 | 0.09 |
| 0.01959125681934859 | 0.5 |
| 0.022110860821109246 | 0.03 |
| 0.40656088731881956 | 0.441 |
| 0.061573210426581815 | 0.43 |
| 0.4789425785652015 | 0.537 |
| 0.09927950891327064 | 0.125 |
| 0.43058984362401376 | 0.637 |
| 0.2802201551844975 | 0.668 |
| 0.34112521850739985 | 0.619 |
| 0.29319461208725506 | 0.904 |
| 0.23285152887630634 | 0.463 |
| 0.10280014521778114 | 0.304 |
| 0.3179950469586451 | 0.332 |
| 0.13296077767208303 | 0.469 |
| 0.09840643042007924 | 0.394 |
| 0.004430144847777373 | 0.172 |
| 0.11746376511792644 | 0.152 |
| 0.2270631656552723 | 0.675 |
| 0.04935867136637406 | 0.112 |
| 0.295672780764638 | 0.353 |
| 0.5401321257931033 | 0.721 |
| 0.0587409863790912 | 0.391 |
| 0.49804406907422427 | 0.766 |
| 0.2515691852453694 | 0.437 |
| 0.14645411785520113 | 0.4 |
| 0.047671927034201644 | 0.324 |
| 0.04963885390943801 | 0.405 |
| 0.7803186573049861 | 0.854 |
| 0.049103948532028596 | 0.567 |
| 0.5875025502518965 | 0.723 |
| 0.032739609799088965 | 0.444 |
| 0.25402041595062974 | 0.736 |
| 0.0024161138616909383 | 0.518 |
| 0.024432583632844507 | 0.109 |
| 0.30405813283944827 | 0.422 |
| 0.10663126405912937 | 0.131 |
| 0.05122867833943723 | 0.096 |
| 0.00013171395549438358 | 0.359 |
| 0.2453957983163465 | 0.253 |
| 0.7156490097341959 | 0.768 |
| 0.6417739829517172 | 0.716 |
| 0.3210033038437451 | 0.345 |
| 0.007752952912372102 | 0.466 |
| 0.627170954322907 | 0.643 |
| 0.38949553736456277 | 0.41 |
| 0.48314883111725393 | 0.565 |
| 0.2799874973264136 | 0.781 |
| 0.4304734088550042 | 0.493 |
| 0.13116998705339533 | 0.749 |
| 0.027863541317250884 | 0.767 |
| 0.06659655486505556 | 0.165 |
| 0.09816759756507354 | 0.136 |
| 0.09448723445828977 | 0.224 |
| 0.39684403793063516 | 0.608 |
| 0.13474825375796973 | 0.171 |
| 0.512277991416436 | 0.842 |
| 0.32702568953782984 | 0.613 |
| 0.08770782547639133 | 0.432 |
| 0.43680036706087755 | 0.464 |
| 0.3372366582391765 | 0.539 |
| 0.0607707626159214 | 0.506 |
| 0.10185542427531569 | 0.26 |
| 0.14515914702360366 | 0.161 |
| 0.0806634323862575 | 0.196 |
| 0.4585810640184541 | 0.53 |
| 0.28818627392843876 | 0.812 |
| 0.16929496874479788 | 0.55 |
| 0.3406071738184173 | 0.35 |
| 0.4206704786027251 | 0.651 |
| 0.11478675523844062 | 0.135 |
| 0.005959364851880755 | 0.146 |
| 0.46990167707254815 | 0.816 |
| 0.04043056797390743 | 0.5 |
| 0.28957720069402604 | 0.822 |
| 0.500962390587564 | 0.515 |
| 0.019930900568057797 | 0.409 |
| 0.28819697845164316 | 0.402 |
| 0.3619734687569339 | 0.712 |
| 0.6179675621610907 | 0.754 |
| 0.3654264504922947 | 0.612 |
| 0.5407750791002699 | 0.762 |
| 0.1499616610672646 | 0.198 |
| 0.03164291972936406 | 0.151 |
| 0.5686489164904158 | 0.854 |
| 0.24255989865832084 | 0.285 |
| 0.3012643534408027 | 0.526 |
| 0.2735309208815444 | 0.54 |
| 0.4666486655629444 | 0.699 |
| 0.1281809578601163 | 0.315 |
| 0.10226428548476307 | 0.622 |
| 0.3381668072418782 | 0.491 |
| 0.5593391424299705 | 0.794 |
| 0.4811198141453318 | 0.693 |
| 0.0984388595113802 | 0.65 |
| 0.07618187344198568 | 0.572 |
| 0.13504835950223282 | 0.263 |
| 0.5243828916622446 | 0.577 |
| 0.08157229225684726 | 0.374 |
| 0.10012085425730033 | 0.545 |
| 0.04405062013040506 | 0.488 |
| 0.39315070101844596 | 0.766 |
| 0.32881256829363403 | 0.504 |
| 0.25782835111841773 | 0.258 |
| 0.1238726371386133 | 0.139 |
| 0.2183580959170509 | 0.373 |
| 0.052336985943709835 | 0.345 |
| 0.033174775200829565 | 0.248 |
| 0.5547212264239854 | 0.571 |
| 0.17918724872193903 | 0.35 |
| 0.12118144120562713 | 0.361 |
| 0.6862021449415424 | 0.874 |
| 0.04611918495254996 | 0.065 |
| 0.08766555005314114 | 0.139 |
| 0.5505268741140442 | 0.78 |
| 0.11119270068689724 | 0.522 |
| 0.001112883043284274 | 0.56 |
| 0.37523478379304687 | 0.558 |
| 0.3071037095771534 | 0.802 |
| 0.4773035728574905 | 0.693 |
| 0.08254584626725348 | 0.252 |
| 0.015249205724440329 | 0.165 |
| 0.12599285228380763 | 0.292 |
| 0.2893406772186984 | 0.419 |
| 0.566008736709635 | 0.695 |
| 0.16895919712118324 | 0.33 |
| 0.5109207270913414 | 0.635 |
| 0.11110150911492955 | 0.404 |
| 0.11848845612567716 | 0.791 |
| 0.00153380821257465 | 0.308 |
| 0.12144614211113447 | 0.346 |
| 0.25486062365938644 | 0.871 |
| 0.21007850868765254 | 0.636 |
| 0.6627802465449708 | 0.807 |
| 0.16069553756798272 | 0.764 |
| 0.15447412873908983 | 0.308 |
| 0.5626782882760215 | 0.614 |
| 0.2621234471754058 | 0.349 |
| 0.36741027677311167 | 0.623 |
| 0.3792398633324502 | 0.469 |
| 0.42320641361768263 | 0.655 |
| 0.06117030342258534 | 0.298 |
| 0.24067776682383857 | 0.546 |
| 0.2576526620076359 | 0.637 |
| 0.025556959636654164 | 0.148 |
| 0.36692565437978786 | 0.387 |
| 0.19453461842032127 | 0.414 |
| 0.38045310677842203 | 0.727 |
| 0.13937546515882093 | 0.5 |
| 0.11242962931741196 | 0.282 |
| 0.1965387975781826 | 0.802 |
| 0.2531606081075535 | 0.445 |
| 0.6553309796643552 | 0.735 |
| 0.4237335644494359 | 0.437 |
| 0.10819309128671228 | 0.164 |
| 0.07186546090681467 | 0.245 |
| 0.5124971558925971 | 0.919 |
| 0.22946648528053348 | 0.638 |
| 0.4934738480597366 | 0.806 |
| 0.5494739141645651 | 0.595 |
| 0.6473607909978527 | 0.686 |
| 0.21320335243495148 | 0.421 |
| 0.14379536561460438 | 0.277 |
| 0.05853328669073954 | 0.745 |
| 0.1780508539331901 | 0.289 |
| 0.2076729534392967 | 0.673 |
| 0.0009611419629483864 | 0.098 |
| 0.017382153688953017 | 0.113 |
| 0.22359657403788058 | 0.649 |
| 0.6998235652030244 | 0.743 |
| 0.09928376368804259 | 0.109 |
| 0.11250094511086961 | 0.648 |
| 0.21588591685735903 | 0.408 |
| 0.08823723193252064 | 0.092 |
| 0.13064932056484857 | 0.425 |
| 0.39287883121440803 | 0.589 |
| 0.10921129626679182 | 0.53 |
| 0.4887937216356627 | 0.797 |
| 0.19940825855493216 | 0.23 |
| 0.09052774491316473 | 0.586 |
| 0.9315822617763783 | 0.957 |
| 0.08066346499672938 | 0.17 |
| 0.01535018345190986 | 0.142 |
| 0.03526142072787075 | 0.58 |
| 0.5093451415339345 | 0.592 |
| 0.3070070831252718 | 0.601 |
| 0.19977604391382764 | 0.337 |
| 0.0968892694187301 | 0.429 |
| 0.2368652418197651 | 0.27 |
| 0.1565389787442324 | 0.296 |
| 0.4430732119840226 | 0.707 |
| 0.4578581901056066 | 0.46 |
| 0.36123541466409215 | 0.363 |
| 0.5367391305754566 | 0.547 |
| 0.26714595522136053 | 0.299 |
| 0.38735248045185966 | 0.465 |
| 0.8615983670893429 | 0.919 |
| 0.40084117414397935 | 0.402 |
| 0.12006002884452793 | 0.44 |
| 0.17539220230618102 | 0.226 |
| 0.10416258730390893 | 0.7 |
| 0.4306426273492162 | 0.704 |
| 0.33817228624139395 | 0.569 |
| 0.36023062775623194 | 0.547 |
| 0.3026098043371418 | 0.652 |
| 0.5675599585993243 | 0.794 |
| 0.27900036106084714 | 0.647 |
| 0.7583749279863605 | 0.907 |
| 0.23152750855740178 | 0.257 |
| 0.06852874567276279 | 0.148 |
| 0.5026526129940887 | 0.632 |
| 0.2099328782037877 | 0.373 |
| 0.1325114963176407 | 0.371 |
| 0.043442114787990205 | 0.22 |
| 0.004685364745268372 | 0.289 |
| 0.12222245177784252 | 0.407 |
| 0.3744164839587746 | 0.516 |
| 0.07769566869499722 | 0.101 |
| 0.19737279958086928 | 0.447 |
| 0.3736812142229361 | 0.744 |
| 0.16781689393343746 | 0.892 |
| 0.5190887012944482 | 0.602 |
| 0.005377995362692234 | 0.124 |
| 0.04966677552734167 | 0.486 |
| 0.0678049301172573 | 0.467 |
| 0.08840054276577924 | 0.161 |
| 0.05608660517186448 | 0.812 |
| 0.2887402469346332 | 0.676 |
| 0.008341087074469455 | 0.275 |
| 0.4366041317947026 | 0.592 |
| 0.12420010529647674 | 0.248 |
| 0.1575700426667056 | 0.357 |
| 0.07150816648134461 | 0.237 |
| 0.042841839405440285 | 0.21 |
| 0.27251100878281265 | 0.319 |
| 0.5736341913310026 | 0.747 |
| 0.10788466632207838 | 0.567 |
| 0.5612396579961387 | 0.835 |
| 0.19777462890323616 | 0.516 |
| 0.21434051966696 | 0.605 |
| 0.03668314743304124 | 0.221 |
| 0.2523118038871154 | 0.556 |
| 0.27760025348043005 | 0.296 |
| 0.18417285286149299 | 0.596 |
| 0.2051327952521238 | 0.328 |
| 0.44768867981793803 | 0.648 |
| 0.24115428359153224 | 0.278 |
| 0.04059660416756472 | 0.732 |
| 0.19714741905772526 | 0.243 |
| 0.14651244737621694 | 0.766 |
| 0.072618093464478 | 0.699 |
| 0.06918629131451515 | 0.268 |
| 0.2883629217914234 | 0.448 |
| 0.1307565810053316 | 0.724 |
| 0.08188718828263553 | 0.371 |
| 0.4253201657945843 | 0.59 |
| 0.33533456409167206 | 0.599 |
| 0.03151716449752873 | 0.284 |
| 0.2500582109791186 | 0.941 |
| 0.052116265989379795 | 0.375 |
| 0.44984417111325214 | 0.734 |
| 0.24859434996871876 | 0.726 |
| 0.010246629972405996 | 0.167 |
| 0.09229773096221106 | 0.228 |
| 0.11249912656662642 | 0.228 |
| 0.5660727617264836 | 0.671 |
| 0.10536529124102256 | 0.26 |
| 0.34422396275469114 | 0.56 |
| 0.27700453460336616 | 0.383 |
| 0.22257277027248512 | 0.318 |
| 0.25740511015707057 | 0.555 |
| 0.38405291270848496 | 0.645 |
| 0.08681655740645677 | 0.54 |
| 0.1338796195234181 | 0.168 |
| 0.2563323375771499 | 0.729 |
| 0.26036924930715544 | 0.363 |
| 0.7330847410635956 | 0.852 |
| 0.06888042517628801 | 0.251 |
| 0.11170394950901052 | 0.808 |
| 0.11420304054592356 | 0.146 |
| 0.5027253831734262 | 0.653 |
| 0.12493912854155353 | 0.496 |
| 0.22548474484538572 | 0.394 |
| 0.1100124576097602 | 0.298 |
| 0.15228160757381004 | 0.209 |
| 0.8371080536805037 | 0.981 |
| 0.014437524578950645 | 0.229 |
| 0.13609237025404242 | 0.794 |
| 0.3641835959958124 | 0.752 |
| 0.2205696797903225 | 0.445 |
| 0.4756498718374249 | 0.814 |
| 0.05976768778847297 | 0.899 |
| 0.735108898975218 | 0.849 |
| 0.17472109145660453 | 0.636 |
| 0.03851052415205736 | 0.427 |
| 0.4133078238237895 | 0.541 |
| 0.361485664028074 | 0.402 |
| 0.25174753591255605 | 0.654 |
| 0.7684831968614605 | 0.808 |
| 0.4054431291585854 | 0.416 |
| 0.13374964014958213 | 0.274 |
| 0.17249411336716813 | 0.64 |
| 0.22907655204754152 | 0.371 |
| 0.0870032705229028 | 0.535 |
| 0.06372383237176638 | 0.176 |
| 0.4217052543321296 | 0.629 |
| 0.4344217886378422 | 0.562 |
| 0.08793258040458796 | 0.36 |
| 0.24521464549079752 | 0.568 |
| 0.25822663184907757 | 0.485 |
| 0.048637693982816144 | 0.457 |
| 0.22129001495466116 | 0.381 |
| 0.0023513542689445055 | 0.139 |
| 0.5230460356156893 | 0.772 |
| 0.5746404208480348 | 0.838 |
| 0.0928933657645491 | 0.114 |
| 0.11492763154106134 | 0.174 |
| 0.0055635527493441694 | 0.454 |
| 0.10432590503366035 | 0.297 |
| 0.13938799025273862 | 0.762 |
| 0.3455825825556996 | 0.536 |
| 0.2862570436704499 | 0.342 |
| 0.23955555168926002 | 0.439 |
| 0.006107584493797225 | 0.493 |
| 0.1992797603840617 | 0.806 |
| 0.02371996282936195 | 0.477 |
| 0.372119990773476 | 0.844 |
| 0.562134616887747 | 0.72 |
| 0.263116545270066 | 0.293 |
| 0.062318807692024136 | 0.445 |
| 0.21902829012542924 | 0.315 |
| 0.14812551213212666 | 0.817 |
| 0.6142098049487134 | 0.651 |
| 0.3199517250547097 | 0.435 |
| 0.10076154002860671 | 0.201 |
| 0.1711611652438686 | 0.648 |
| 0.17949962533829666 | 0.542 |
| 0.41066281473102906 | 0.538 |
| 0.09924956452713973 | 0.299 |
| 0.5430505644603691 | 0.586 |
| 0.03814833981730992 | 0.058 |
| 0.011995155272296998 | 0.667 |
| 0.2603586009583785 | 0.686 |
| 0.09402731987632851 | 0.261 |
| 0.08089715801889952 | 0.224 |
| 0.07223861232742834 | 0.443 |
| 0.40672790735241793 | 0.79 |
| 0.3983913307196696 | 0.804 |
| 0.29132888311515126 | 0.617 |
| 0.4782048831769754 | 0.504 |
| 0.0909396187991327 | 0.903 |
| 0.5609711517286462 | 0.625 |
| 0.16162883639560632 | 0.5 |
| 0.030287249859697774 | 0.079 |
| 0.18700578002710144 | 0.756 |
| 0.17008294326677664 | 0.263 |
| 0.1914976490905136 | 0.238 |
| 0.35928827895750937 | 0.473 |
| 0.3714406038721786 | 0.473 |
| 0.3764852637998294 | 0.465 |
| 0.5618842225052995 | 0.67 |
| 0.6027724077544786 | 0.826 |
| 0.0497003718067166 | 0.204 |
| 0.6845442497389247 | 0.878 |
| 0.564576010929102 | 0.941 |
| 0.07094077297709267 | 0.223 |
| 0.14337303837816684 | 0.498 |
| 0.38355761146367207 | 0.637 |
| 0.27973523514476273 | 0.414 |
| 0.2504879185911516 | 0.295 |
| 0.13888006922685003 | 0.437 |
| 0.16376121359626383 | 0.343 |
| 0.264194562995801 | 0.278 |
| 0.06664554663562405 | 0.238 |
| 0.4219439796725245 | 0.46 |
| 0.08418404661041434 | 0.142 |
| 0.5627516510243569 | 0.708 |
| 0.21804807612264498 | 0.414 |
| 0.3916064465450625 | 0.519 |
| 0.020341421550039485 | 0.276 |
| 0.34273688438922223 | 0.371 |
| 0.4309649358242895 | 0.565 |
| 0.09842963280791561 | 0.148 |
| 0.14433973102035558 | 0.426 |
| 0.0026831812224207274 | 0.048 |
| 0.04363850887508858 | 0.419 |
| 0.6439004181651012 | 0.835 |
| 0.4632732183985083 | 0.705 |
| 0.013108817145360718 | 0.232 |
| 0.12194815033285322 | 0.207 |
| 0.1512042036425144 | 0.58 |
| 0.1716877904479176 | 0.474 |
| 0.05258679586213699 | 0.46 |
| 0.07971134727105222 | 0.107 |
| 0.27146868041065675 | 0.553 |
| 0.0468750314923414 | 0.445 |
| 0.04877317191674069 | 0.161 |
| 0.07720502078048763 | 0.52 |
| 0.3241525863898964 | 0.717 |
| 0.12319949077172176 | 0.339 |
| 0.15650744738684397 | 0.263 |
| 0.010898461576405616 | 0.318 |
| 0.018011871169753224 | 0.285 |
| 0.2567924444448674 | 0.352 |
| 0.23956112088076797 | 0.589 |
| 0.19906045894473523 | 0.543 |
| 0.24553597953691442 | 0.508 |
| 0.42979149463783073 | 0.807 |
| 0.24132350974207695 | 0.823 |
| 0.6159768934800836 | 0.794 |
| 0.07673556754883903 | 0.452 |
| 0.5134890605865243 | 0.575 |
| 0.2928043528134133 | 0.517 |
| 0.10580759343776502 | 0.226 |
| 0.37888309017346544 | 0.582 |
| 0.26897856469065184 | 0.446 |
| 0.39098155482367936 | 0.722 |
| 0.22175353446023371 | 0.813 |
| 0.3546370495589689 | 0.78 |
| 0.4684844004324489 | 0.545 |
| 0.3483709080613988 | 0.508 |
| 0.2806875860000667 | 0.432 |
| 0.020779269494359265 | 0.288 |
| 0.3718172967698278 | 0.452 |
| 0.18967736793575862 | 0.197 |
| 0.21696097745895493 | 0.59 |
| 0.16732510206880113 | 0.352 |
| 0.22127065252933553 | 0.534 |
| 0.46922818508570396 | 0.47 |
| 0.8072706903545162 | 0.859 |
| 0.3986742604014427 | 0.612 |
| 0.45143456612702504 | 0.898 |
| 0.12526826854997608 | 0.583 |
| 0.055950811946436696 | 0.128 |
| 0.10149395816940832 | 0.191 |
| 0.24639354695042404 | 0.506 |
| 0.17592000391321194 | 0.284 |
| 0.012627704604487588 | 0.447 |
| 0.0004531403741282469 | 0.726 |
| 0.054230932468962934 | 0.309 |
| 0.19628940430416586 | 0.59 |
| 0.21248001232347535 | 0.825 |
| 0.3088470298170558 | 0.649 |
| 0.6125180122537273 | 0.68 |
| 0.32674535572534247 | 0.527 |
| 0.22212273237660485 | 0.334 |
| 0.7334260080717278 | 0.866 |
| 0.4133123390820398 | 0.707 |
| 0.259901347498117 | 0.34 |
| 0.09790337833453366 | 0.132 |
| 0.1272505795422857 | 0.585 |
| 0.19517958830551985 | 0.552 |
| 0.16405070067178407 | 0.187 |
| 0.6806614259168509 | 0.888 |
| 0.06453449326004168 | 0.768 |
| 0.07947719233555439 | 0.788 |
| 0.38795881300069346 | 0.407 |
| 0.04104202280197766 | 0.053 |
| 0.2675049649778679 | 0.357 |
| 0.13616032263628675 | 0.233 |
| 0.5778394161867302 | 0.611 |
| 0.13439022113621535 | 0.631 |
| 0.762858450012569 | 0.81 |
| 0.3431662458899707 | 0.379 |
| 0.344197756266302 | 0.359 |
| 0.5434752028950954 | 0.774 |
| 0.20632585505424272 | 0.333 |
| 0.19158959175750878 | 0.303 |
| 0.5127837924012494 | 0.677 |
| 0.10572815476385677 | 0.11 |
| 0.3812906899977171 | 0.438 |
| 0.03237468863653192 | 0.509 |
| 0.42925512544460664 | 0.526 |
| 0.18159972783726241 | 0.736 |
| 0.053473837445924155 | 0.236 |
| 0.030408474831556953 | 0.439 |
| 0.06531014214063402 | 0.484 |
| 0.4253879555000317 | 0.882 |
| 0.6597070140187943 | 0.88 |
| 0.4860695702792396 | 0.498 |
| 0.10943991170039391 | 0.164 |
| 0.33940175492385904 | 0.419 |
| 0.3054055850390981 | 0.522 |
| 0.2769886467065852 | 0.656 |
| 0.24596150067900913 | 0.351 |
| 0.061740134632846666 | 0.564 |
| 0.4896467799031793 | 0.67 |
| 0.3305251421032913 | 0.338 |
| 0.199402296931374 | 0.631 |
| 0.7020033045802808 | 0.76 |
| 0.6421339601611221 | 0.755 |
| 0.4460046670651028 | 0.721 |
| 0.05971354760426906 | 0.17 |
| 0.12548179207738808 | 0.158 |
| 0.13986454432026896 | 0.174 |
| 0.08608030561831181 | 0.209 |
| 0.01178491409824911 | 0.453 |
| 0.267500357007444 | 0.769 |
| 0.47567724601212047 | 0.596 |
| 0.181166107541484 | 0.35 |
| 0.13588120127270964 | 0.21 |
| 0.2486774708796189 | 0.552 |
| 0.3898093495910806 | 0.542 |
| 0.5293785072331335 | 0.619 |
| 0.3855574135588309 | 0.482 |
| 0.5899113156118386 | 0.61 |
| 0.222244424340729 | 0.467 |
| 0.01940437438402476 | 0.049 |
| 0.011303317080254227 | 0.229 |
| 0.0874254177441448 | 0.408 |
| 0.7118195848739998 | 0.748 |
| 0.04095849710741728 | 0.431 |
| 0.1688059310849016 | 0.267 |
| 0.51288759956222 | 0.745 |
| 0.1611725506060504 | 0.364 |
| 0.156128728516569 | 0.519 |
| 0.766238201309991 | 0.941 |
| 0.12023664998196304 | 0.215 |
| 0.3415128541392457 | 0.684 |
| 0.1379977541937777 | 0.15 |
| 0.7260364911513074 | 0.868 |
| 0.3138007017552358 | 0.396 |
| 0.4038830849096289 | 0.914 |
| 0.30271595942593865 | 0.774 |
| 0.16051869978981836 | 0.508 |
| 0.7587046981358863 | 0.899 |
| 0.7189222197758781 | 0.908 |
| 0.06253452797625791 | 0.452 |
| 0.13395568954924153 | 0.71 |
| 0.02734589772971585 | 0.743 |
| 0.014303442083780094 | 0.559 |
| 0.15212339633028993 | 0.547 |
| 0.026126901127122792 | 0.121 |
| 0.5156925008747925 | 0.547 |
| 0.47232902809660215 | 0.664 |
| 0.1713745839159878 | 0.754 |
| 0.5510519843741373 | 0.726 |
| 0.2282845214647652 | 0.32 |
| 0.3561512533958976 | 0.598 |
| 0.27830408556780994 | 0.343 |
| 0.06229201228697623 | 0.163 |
| 0.16724306228509123 | 0.246 |
| 0.03423103204660316 | 0.431 |
| 0.277073799315246 | 0.705 |
| 0.15470658792322134 | 0.472 |
| 0.0006979414171115472 | 0.506 |
| 0.4630184825863908 | 0.525 |
| 0.4370124659013217 | 0.534 |
| 0.15502383920399743 | 0.328 |
| 0.11151912325254099 | 0.675 |
| 0.22126271209592618 | 0.31 |
| 0.5489355997444719 | 0.721 |
| 0.507704208342765 | 0.865 |
| 0.07389122454372254 | 0.074 |
| 0.02798371050754611 | 0.519 |
| 0.10994595014911646 | 0.224 |
| 0.2598033303351711 | 0.37 |
| 0.8046033889422108 | 0.916 |
| 0.00514474388522379 | 0.561 |
| 0.2609651957622784 | 0.489 |
| 0.29333496006396353 | 0.47 |
| 0.1593580956966788 | 0.549 |
| 0.6245360404223335 | 0.635 |
| 0.0024801588526428553 | 0.151 |
| 0.3154275795992043 | 0.582 |
| 0.3640057131910862 | 0.81 |
| 0.09112251075281619 | 0.149 |
| 0.14907669080000985 | 0.451 |
| 0.16804334152762102 | 0.513 |
| 0.0053488661521600145 | 0.558 |
| 0.10270783559599761 | 0.325 |
| 0.28624379646450104 | 0.361 |
| 0.6207030314844257 | 0.799 |
| 0.21528814543146746 | 0.386 |
| 0.6585967590500265 | 0.792 |
| 0.05788715413447265 | 0.433 |
| 0.30093502883718004 | 0.505 |
| 0.10916642736855608 | 0.664 |
| 0.08538015692982226 | 0.123 |
| 0.5324585906586934 | 0.895 |
| 0.06778519117400483 | 0.721 |
| 0.1592113638633451 | 0.673 |
| 0.02902748047177872 | 0.068 |
| 0.017744690899357818 | 0.215 |
| 0.43817061504792354 | 0.737 |
| 0.3918542123959151 | 0.692 |
| 0.01814328928359976 | 0.18 |
| 0.04409614965387243 | 0.294 |
| 0.4961912331824012 | 0.559 |
| 0.026394622828248337 | 0.404 |
| 0.23923003494316875 | 0.285 |
| 0.5634444085413336 | 0.738 |
| 0.06387821478181299 | 0.119 |
| 0.195667029597008 | 0.647 |
| 0.28391539012011635 | 0.437 |
| 0.5842587904014286 | 0.813 |
| 0.27532617599524933 | 0.871 |
| 0.6508194527630838 | 0.752 |
| 0.016068544636191118 | 0.179 |
| 0.21380746008250096 | 0.374 |
| 0.06438292508956323 | 0.471 |
| 0.14791401205714894 | 0.59 |
| 0.011527544310471094 | 0.13 |
| 0.444494256648138 | 0.935 |
| 0.4311281172749225 | 0.525 |
| 0.16305165816449219 | 0.211 |
| 0.13842877328017256 | 0.596 |
| 0.4075601041646293 | 0.539 |
| 0.3733700512906367 | 0.817 |
| 0.4856434301082484 | 0.519 |
| 0.21382321864252818 | 0.457 |
| 0.1690017622691471 | 0.239 |
| 0.3219162082499418 | 0.399 |
| 0.07973202033055238 | 0.18 |
| 0.13381774490485643 | 0.576 |
| 0.3320873312317746 | 0.373 |
| 0.019873063323654794 | 0.724 |
| 0.41285510241166057 | 0.635 |
| 0.14399832330389473 | 0.821 |
| 0.0862383351088799 | 0.095 |
| 0.13155324973697557 | 0.343 |
| 0.2198642863984538 | 0.67 |
| 0.41738492004609595 | 0.726 |
| 0.5153102171131667 | 0.523 |
| 0.15144682757138095 | 0.518 |
| 0.2561115284802141 | 0.786 |
| 0.10114549664320716 | 0.652 |
| 0.31358568764911743 | 0.607 |
| 0.6125646852700181 | 0.671 |
| 0.44390689382477455 | 0.877 |
| 0.01178492680185006 | 0.407 |
| 0.188025926363513 | 0.872 |
| 0.29409488643292236 | 0.413 |
| 0.0023609199530012503 | 0.013 |
| 0.06288440656504357 | 0.566 |
| 0.01595322109428776 | 0.33 |
| 0.20036587698639452 | 0.68 |
| 0.13092660103300746 | 0.609 |
| 0.11610878266683378 | 0.271 |
| 0.2479811155607804 | 0.649 |
| 0.5242516173979501 | 0.582 |
| 0.15167974209196455 | 0.846 |
| 0.2447340865860661 | 0.77 |
| 0.23678555335251406 | 0.571 |
| 0.6795500147709009 | 0.842 |
| 0.5173186963913626 | 0.699 |
| 0.3397409018321166 | 0.827 |
| 0.46869560618684847 | 0.708 |
| 0.27896423076788845 | 0.511 |
| 0.1333353266408498 | 0.802 |
| 0.08469070749981267 | 0.17 |
| 0.13047607809633366 | 0.139 |
| 0.5076168651750199 | 0.852 |
| 0.3544118156136944 | 0.42 |
| 0.1400284700972021 | 0.458 |
| 0.701074887285213 | 0.829 |
| 0.12143973888944237 | 0.254 |
| 0.1493442918846758 | 0.21 |
| 0.662249578073521 | 0.735 |
| 0.009595426134104579 | 0.295 |
| 0.1474611069344015 | 0.164 |
| 0.03628412924971691 | 0.155 |
| 0.18396466114511612 | 0.189 |
| 0.27590664039479196 | 0.604 |
| 0.08548956060176582 | 0.287 |
| 0.12880810579438062 | 0.505 |
| 0.3298114877130621 | 0.353 |
| 0.569988625283853 | 0.804 |
| 0.056007580048064165 | 0.405 |
| 0.24731211157159494 | 0.508 |
| 0.09077283617826504 | 0.867 |
| 0.1154326558106894 | 0.409 |
| 0.13228856871616712 | 0.145 |
| 0.21364629229435772 | 0.694 |
| 0.2241072032531165 | 0.264 |
| 0.08246492485415602 | 0.139 |
| 0.03854687992456807 | 0.946 |
| 0.08215461159180659 | 0.309 |
| 0.027460753740275567 | 0.09 |
| 0.1521609736857218 | 0.557 |
| 0.09204036798341964 | 0.252 |
| 0.5968942802713878 | 0.753 |
| 0.187034284773406 | 0.373 |
| 0.5236195632385516 | 0.606 |
| 0.2997062369958239 | 0.382 |
| 0.08780101914655136 | 0.208 |
| 0.3487161909187543 | 0.416 |
| 0.1252603585198172 | 0.315 |
| 0.12764340212760095 | 0.472 |
| 0.061888969560655704 | 0.356 |
| 0.15631704150399484 | 0.16 |
| 0.09390224638401135 | 0.591 |
| 0.4943121595249921 | 0.522 |
| 0.35270132057406745 | 0.425 |
| 0.23214235525031524 | 0.565 |
| 0.1709133022262218 | 0.296 |
| 0.3663495230952235 | 0.465 |
| 0.04239634872389253 | 0.305 |
| 0.07105251153254488 | 0.131 |
| 0.34248724327745317 | 0.527 |
| 0.07704878711679397 | 0.312 |
| 0.175705826098551 | 0.494 |
| 0.05700892978865424 | 0.165 |
| 0.49040884452860156 | 0.568 |
| 0.09016159108891841 | 0.485 |
| 0.12312195491670708 | 0.525 |
| 0.3411158778150005 | 0.642 |
| 0.23440389797574912 | 0.324 |
| 0.038301504773696315 | 0.528 |
| 0.4198968531018046 | 0.712 |
| 0.0002791913563269244 | 0.125 |
| 0.3759471580326982 | 0.668 |
| 0.2351689281523448 | 0.622 |
| 0.11863251165501842 | 0.552 |
| 0.038317313526846974 | 0.207 |
| 0.2919213828883592 | 0.582 |
| 0.26055652021039366 | 0.308 |
| 0.0696332251887174 | 0.084 |
| 0.12839620091388315 | 0.42 |
| 0.06337173482337732 | 0.082 |
| 0.30047267540311895 | 0.407 |
| 0.3764473111171758 | 0.502 |
| 0.4891729767335896 | 0.899 |
| 0.19779237072609712 | 0.401 |
| 0.181197180816275 | 0.2 |
| 0.07818455108340883 | 0.311 |
| 0.18176460531892946 | 0.347 |
| 0.10758263578593819 | 0.149 |
| 0.2004293923665299 | 0.457 |
| 0.19212953959798718 | 0.381 |
| 0.039890523289612845 | 0.099 |
| 0.3526252690212851 | 0.539 |
| 0.4340552791297211 | 0.631 |
| 0.22354948366720373 | 0.396 |
| 0.27831527779913334 | 0.629 |
| 0.2232780006320031 | 0.335 |
| 0.03750449424434321 | 0.568 |
| 0.493802360880364 | 0.589 |
| 0.6507055120738274 | 0.698 |
| 0.27617470984319126 | 0.72 |
| 0.4031496006906127 | 0.518 |
| 0.4784864167757318 | 0.66 |
| 0.0033335040438045027 | 0.428 |
| 0.023753247182346393 | 0.464 |
| 0.004010472300720047 | 0.385 |
| 0.4881874310176456 | 0.684 |
| 0.3944517397294772 | 0.436 |
| 0.1430612562221718 | 0.292 |
| 0.40637630864106367 | 0.42 |
| 0.2861101160479744 | 0.61 |
| 0.16550111757504737 | 0.184 |
| 0.20462298049096928 | 0.584 |
| 0.21771663322321033 | 0.341 |
| 0.26802615917628847 | 0.736 |
| 0.054755591029204576 | 0.299 |
| 0.2906041802196032 | 0.549 |
| 0.14037975748264697 | 0.385 |
| 0.38815420789283295 | 0.863 |
| 0.12977056452801417 | 0.361 |
| 0.6628571465120857 | 0.874 |
| 0.6296932274136288 | 0.84 |
| 0.22939898893971955 | 0.442 |
| 0.34906922988211353 | 0.502 |
| 0.4933019671233334 | 0.786 |
| 0.33176949322393257 | 0.65 |
| 0.05879235064171062 | 0.671 |
| 0.6272630139598684 | 0.758 |
| 0.32581259984052824 | 0.449 |
| 0.6913296440943112 | 0.811 |
| 0.1618888583037923 | 0.478 |
| 0.19125639987204823 | 0.274 |
| 0.39797805423031085 | 0.781 |
| 0.011301775413790072 | 0.621 |
| 0.35134315145552264 | 0.44 |
| 0.049993385789880884 | 0.353 |
| 0.15522841361631512 | 0.293 |
| 0.07179184804589267 | 0.127 |
| 0.16568286308255176 | 0.796 |
| 0.15002304678136946 | 0.601 |
| 0.32150435141366795 | 0.526 |
| 0.2335771567828927 | 0.325 |
| 0.02913756796762923 | 0.469 |
| 0.07932184687978405 | 0.608 |
| 0.06154482579391318 | 0.326 |
| 0.03397950071776168 | 0.066 |
| 0.18744874011792612 | 0.564 |
| 0.007097975824436831 | 0.435 |
| 0.20925742783942347 | 0.463 |
| 0.5797533767435212 | 0.643 |
| 0.33623437618108964 | 0.457 |
| 0.4591764701815093 | 0.705 |
| 0.694638889258761 | 0.709 |
| 0.44926884704927317 | 0.716 |
| 0.35314315526385764 | 0.641 |
| 0.21896243957372286 | 0.806 |
| 0.33396006449930804 | 0.677 |
| 0.14485590306858032 | 0.262 |
| 0.11583664468915333 | 0.142 |
| 0.05173944587005186 | 0.576 |
| 0.26589080319082137 | 0.278 |
| 0.06653476721544149 | 0.608 |
| 0.41841277564437707 | 0.76 |
| 0.18592240456625098 | 0.767 |
| 0.037112760660150235 | 0.046 |
| 0.4995534076933168 | 0.889 |
| 0.21637591117268873 | 0.524 |
| 0.26220035036436795 | 0.766 |
| 0.323669867495034 | 0.491 |
| 0.32206410497272264 | 0.337 |
| 0.02425468539835096 | 0.05 |
| 0.2594174261958696 | 0.682 |
| 0.09856570213302962 | 0.406 |
| 0.1836425036256777 | 0.194 |
| 0.02926365127272479 | 0.197 |
| 0.196424683447174 | 0.405 |
| 0.42463677075663153 | 0.604 |
| 0.2924928497569853 | 0.399 |
| 0.04587238886118716 | 0.088 |
| 0.159430548539794 | 0.466 |
| 0.3342530193575012 | 0.421 |
| 0.594843347848145 | 0.814 |
| 0.6486260730010909 | 0.732 |
| 0.04544299442190114 | 0.113 |
| 0.027911621865353453 | 0.761 |
| 0.41261428673934464 | 0.533 |
| 0.3880866418858059 | 0.724 |
| 0.270279071188384 | 0.319 |
| 0.3915749679049626 | 0.921 |
| 0.22872239914663317 | 0.324 |
| 0.016905535570802988 | 0.551 |
| 0.23985148782036414 | 0.287 |
| 0.042572307828204536 | 0.304 |
| 0.1089350516246288 | 0.43 |
| 0.12216853111122028 | 0.2 |
| 0.08553668309288276 | 0.536 |
| 0.1839198969257756 | 0.598 |
| 0.22086283467082257 | 0.298 |
| 0.4367521974428977 | 0.562 |
| 0.39718037532341066 | 0.405 |
| 0.08341037510067861 | 0.721 |
| 0.1615573805178261 | 0.371 |
| 0.12704689953080617 | 0.365 |
| 0.17088142845261511 | 0.715 |
| 0.1386578219410124 | 0.241 |
| 0.7597943542700148 | 0.852 |
| 0.17368964376330764 | 0.228 |
| 0.03204083147756498 | 0.54 |
| 0.01252908694779764 | 0.228 |
| 0.0725133268469701 | 0.692 |
| 0.20176357243653753 | 0.772 |
| 0.27107777570505176 | 0.307 |
| 0.055919485837309435 | 0.284 |
| 0.1595213821994551 | 0.24 |
| 0.17076491042594155 | 0.237 |
| 0.4886491676963908 | 0.615 |
| 0.2023593860938233 | 0.349 |
| 0.4604243197011636 | 0.728 |
| 0.25094519423266826 | 0.256 |
| 0.0372279669599056 | 0.354 |
| 0.4605917129377448 | 0.589 |
| 0.4991957376931623 | 0.546 |
| 0.18385862775228434 | 0.219 |
| 0.40363215938368957 | 0.754 |
| 0.010501191217113126 | 0.078 |
| 0.21624948317439707 | 0.279 |
| 0.20266550346779622 | 0.329 |
| 0.9881187529498818 | 0.991 |
| 0.15922789482919664 | 0.183 |
| 0.09865315751005754 | 0.181 |
| 0.14720596948337972 | 0.499 |
| 0.29222845379380347 | 0.526 |
| 0.10426259739230925 | 0.112 |
| 0.6286323923713529 | 0.678 |
| 0.5596120647051126 | 0.784 |
| 0.08094438729579756 | 0.452 |
| 0.08654681316632395 | 0.29 |
| 0.04160128320230416 | 0.671 |
| 0.5563150246159247 | 0.68 |
| 0.18830110696016022 | 0.858 |
| 0.0856756662778475 | 0.303 |
| 0.11995227106316309 | 0.565 |
| 0.2006483841293889 | 0.25 |
| 0.17733461711346388 | 0.731 |
| 0.09697841782155114 | 0.552 |
| 0.826463106711477 | 0.892 |
| 0.17193469604313427 | 0.172 |
| 0.12160279071691982 | 0.642 |
| 0.49475057133794975 | 0.525 |
| 0.4682896614473878 | 0.753 |
| 0.06675852974845375 | 0.481 |
| 0.6417313434224139 | 0.685 |
| 0.3626044644905321 | 0.436 |
| 0.08300930309101406 | 0.168 |
| 0.09010867497988717 | 0.454 |
| 0.256337278694719 | 0.749 |
| 0.5396509928395538 | 0.732 |
| 0.019371109576110435 | 0.714 |
| 0.2648922852633081 | 0.708 |
| 0.5504149967263904 | 0.881 |
| 0.7220030015851486 | 0.847 |
| 0.053724414446181035 | 0.189 |
| 0.6234988410702001 | 0.63 |
| 0.20530265140464865 | 0.69 |
| 0.39399092124798196 | 0.621 |
| 0.37369572017208685 | 0.521 |
| 0.2841893007585352 | 0.65 |
| 0.060462496193185666 | 0.105 |
| 0.14399108211672373 | 0.446 |
| 0.036112270636053934 | 0.6 |
| 0.10495757855321208 | 0.35 |
| 0.2987601546524442 | 0.387 |
| 0.36231089424557006 | 0.65 |
| 0.4012918909530039 | 0.464 |
| 0.010675056649093628 | 0.075 |
| 0.16310802590912232 | 0.707 |
| 0.3491392407808871 | 0.441 |
| 0.1134215923077233 | 0.511 |
| 0.3270005233797957 | 0.583 |
| 0.4896541831804224 | 0.625 |
| 0.03554215239178382 | 0.068 |
| 0.4059084930624537 | 0.743 |
| 0.8518581869176477 | 0.863 |
| 0.10391082543649799 | 0.167 |
| 0.5047437768402379 | 0.909 |
| 0.2708076674245793 | 0.527 |
| 0.027368842216188072 | 0.053 |
| 0.32912663976840706 | 0.36 |
| 0.5021503643875882 | 0.581 |
| 0.08268728715286888 | 0.449 |
| 0.09104119208737083 | 0.405 |
| 0.1988202895795126 | 0.271 |
| 0.11998926249226427 | 0.894 |
| 0.016231996732222642 | 0.346 |
| 0.1183303682061635 | 0.573 |
| 0.3422873403069595 | 0.559 |
| 0.21257382107335954 | 0.833 |
| 0.6887394346317793 | 0.72 |
| 0.24721582561862077 | 0.512 |
| 0.040234820403753035 | 0.046 |
| 0.15713932462890523 | 0.239 |
| 0.7368356153799641 | 0.787 |
| 0.13204690913556438 | 0.286 |
| 0.48212544700126636 | 0.652 |
| 0.009465322493848016 | 0.519 |
| 0.49443322753438956 | 0.723 |
| 0.13806767103000595 | 0.354 |
| 0.010177796020058083 | 0.156 |
| 0.09438593943005491 | 0.121 |
| 0.5431505925440651 | 0.966 |
| 0.23099367058217957 | 0.436 |
| 0.4123790707624869 | 0.682 |
| 0.011650956961680392 | 0.139 |
| 0.25358943491875563 | 0.64 |
| 0.02320375072933234 | 0.137 |
| 0.12486717583875351 | 0.327 |
| 0.08999349520827649 | 0.619 |
| 0.01056492056138747 | 0.43 |
| 0.7443161217912121 | 0.954 |
| 0.19176570366855206 | 0.35 |
| 0.027083466429587588 | 0.383 |
| 0.4411518123779745 | 0.831 |
| 0.03468418632315684 | 0.089 |
| 0.14511420539348285 | 0.229 |
| 0.06307365773884521 | 0.233 |
| 0.014748118312566616 | 0.378 |
| 0.0363131753160606 | 0.342 |
| 0.08369678836632943 | 0.55 |
| 0.3279892831405129 | 0.578 |
| 0.16636030651981282 | 0.188 |
| 0.10947899835658792 | 0.862 |
| 0.18735749812617908 | 0.581 |
| 0.1682838159161789 | 0.71 |
| 0.2819977481468482 | 0.683 |
| 0.18439311800311986 | 0.691 |
| 0.27304825408041034 | 0.609 |
| 0.09956162413310155 | 0.417 |
| 0.35374239891784 | 0.615 |
| 0.2812599363630419 | 0.324 |
| 0.3000547001786924 | 0.818 |
| 0.2826759459182022 | 0.8 |
| 0.2760754256973912 | 0.292 |
| 0.03192948611015456 | 0.375 |
| 0.039916251492256416 | 0.151 |
| 0.2542844747015517 | 0.587 |
| 0.11230998296757377 | 0.503 |
| 0.14299004958645778 | 0.183 |
| 0.060642312697394174 | 0.112 |
| 0.06457772154748964 | 0.136 |
| 0.014850294605524561 | 0.171 |
| 0.20748543606396064 | 0.614 |
| 0.004174596176603096 | 0.442 |
| 0.14917251230504003 | 0.28 |
| 0.23321188149694527 | 0.728 |
| 0.10722151368357835 | 0.618 |
| 0.19773747399668706 | 0.399 |
| 0.5230087145702281 | 0.564 |
| 0.20419378183633674 | 0.628 |
| 0.7494468175934026 | 0.951 |
| 0.15427034922454175 | 0.28 |
| 0.09536779194338996 | 0.37 |
| 0.4538260257227297 | 0.483 |
| 0.4478023902995485 | 0.663 |
| 0.2052847382219346 | 0.88 |
| 0.0862940732620181 | 0.218 |
| 0.015609365918904827 | 0.259 |
| 0.08419124166757141 | 0.192 |
| 0.15753554971330153 | 0.271 |
| 0.4654739436603651 | 0.639 |
| 0.006961037241900558 | 0.18 |
| 0.40434536525591913 | 0.49 |
| 0.05034113793936146 | 0.887 |
| 0.320529863999801 | 0.603 |
| 0.12972838143659704 | 0.25 |
| 0.30142287766295817 | 0.707 |
| 0.10328422772778012 | 0.508 |
| 0.12996355220664146 | 0.5 |
| 0.11867206641360228 | 0.12 |
| 0.586733556150978 | 0.606 |
| 0.2322143625945915 | 0.691 |
| 0.19711372595551102 | 0.369 |
| 0.024683737339402878 | 0.536 |
| 0.1070473925541674 | 0.462 |
| 0.5043999861903214 | 0.642 |
| 0.25654033340157567 | 0.763 |
| 0.47504794271879347 | 0.841 |
| 0.43670152814416374 | 0.859 |
| 0.13635404297557152 | 0.179 |
| 0.07558306658610381 | 0.089 |
| 0.013254151933502878 | 0.723 |
| 0.30195281297662824 | 0.492 |
| 0.22451147217734602 | 0.247 |
| 0.2576233787453365 | 0.352 |
| 0.2939953112674465 | 0.587 |
| 0.38067798723431767 | 0.844 |
| 0.13986900725659634 | 0.241 |
| 0.004850896672141336 | 0.647 |
| 0.16941670045017343 | 0.406 |
| 0.05440546191503004 | 0.056 |
| 0.050263323509486146 | 0.423 |
| 0.056626338253333186 | 0.067 |
| 0.0910501743004698 | 0.558 |
| 0.14416535581507783 | 0.46 |
| 0.34057037789803524 | 0.71 |
| 0.005213932215541006 | 0.226 |
| 0.253107490602518 | 0.407 |
| 0.4046498430242055 | 0.587 |
| 0.06467632684143809 | 0.204 |
| 0.3470694346347828 | 0.434 |
| 0.3463107831186627 | 0.435 |
| 0.1659470580304352 | 0.414 |
| 0.15131605647053026 | 0.383 |
| 0.33463354342816365 | 0.468 |
| 0.07689308413331264 | 0.176 |
| 0.033796182422858645 | 0.485 |
| 0.5502358239194424 | 0.567 |
| 0.1950334513424703 | 0.308 |
| 0.0672718644143514 | 0.881 |
| 0.6672786354879332 | 0.728 |
| 0.13044978410801888 | 0.362 |
| 0.09932808522510339 | 0.151 |
| 0.47722638555905383 | 0.696 |
| 0.0708728411417251 | 0.845 |
| 0.508379047004987 | 0.528 |
| 0.23941810441537037 | 0.522 |
| 0.16711378699415214 | 0.88 |
| 0.14110310699050754 | 0.163 |
| 0.011291421889197961 | 0.461 |
| 0.11605264097660406 | 0.664 |
| 0.19598214170640904 | 0.347 |
| 0.3340817703543393 | 0.436 |
| 0.12318490838451468 | 0.193 |
| 0.3864766380620064 | 0.829 |
| 0.2568495341129441 | 0.759 |
| 0.367537035751899 | 0.618 |
| 0.20270693926625116 | 0.292 |
| 0.1859725148377145 | 0.656 |
| 0.574545884957759 | 0.663 |
| 0.08316908202072482 | 0.18 |
| 0.18619210003777265 | 0.277 |
| 0.15229816258111617 | 0.527 |
| 0.40095455426369064 | 0.436 |
| 0.23396223729590615 | 0.447 |
| 0.28205958290875865 | 0.363 |
| 0.5124412287272452 | 0.657 |
| 0.004058220653828659 | 0.823 |
| 0.45730342107104804 | 0.482 |
| 0.09111271067958393 | 0.694 |
| 0.09752004682418225 | 0.252 |
| 0.336754998363026 | 0.631 |
| 0.3807865593288784 | 0.382 |
| 0.3530717787736387 | 0.755 |
| 0.03384255295313987 | 0.16 |
| 0.5513118606175814 | 0.901 |
| 0.07515353704880334 | 0.463 |
| 0.6164897212490147 | 0.98 |
| 0.17629067373043916 | 0.629 |
| 0.2925642585540771 | 0.399 |
| 0.13486872274047013 | 0.194 |
| 0.43687712293969216 | 0.793 |
| 0.3592243108324933 | 0.651 |
| 0.2737506983934552 | 0.873 |
| 0.41328622309799135 | 0.894 |
| 0.32784009088543364 | 0.534 |
| 0.0623748007656596 | 0.46 |
| 0.19788252288595398 | 0.403 |
| 0.2016874490170013 | 0.259 |
| 0.2841444446818294 | 0.303 |
| 0.13916015951384264 | 0.282 |
| 0.3421314777517023 | 0.394 |
| 0.4930615942110509 | 0.802 |
| 0.300369139126777 | 0.765 |
| 0.2912170542484549 | 0.337 |
| 0.27343805711780356 | 0.283 |
| 0.09048655921494331 | 0.673 |
| 0.8724948691311667 | 0.888 |
| 0.4159329172226466 | 0.425 |
| 0.37429210744436425 | 0.83 |
| 0.08727809595708536 | 0.29 |
| 0.39073399984193113 | 0.515 |
| 0.4747828060481656 | 0.984 |
| 0.16603833478585528 | 0.658 |
| 0.08924914874724355 | 0.318 |
| 0.010145264584385139 | 0.227 |
| 0.2963871661698686 | 0.299 |
| 0.03017198349283401 | 0.091 |
| 0.24193004166732268 | 0.458 |
| 0.28082315488859777 | 0.444 |
| 0.19291126462514518 | 0.258 |
| 0.07449411264677053 | 0.081 |
| 0.02328186908911012 | 0.546 |
| 0.661881285771099 | 0.748 |
| 0.4162519288150004 | 0.713 |
| 0.232994898157036 | 0.83 |
| 0.5223552761104674 | 0.692 |
| 0.1917287209925138 | 0.725 |
| 0.1894459258659067 | 0.584 |
| 0.2404320574560499 | 0.526 |
| 0.09914798144216119 | 0.479 |
| 0.23312635663061332 | 0.746 |
| 0.09641584586114449 | 0.774 |
| 0.012765440638592085 | 0.282 |
| 0.2783710895581982 | 0.415 |
| 0.5143305457602579 | 0.806 |
| 0.04007889199488801 | 0.514 |
| 0.013663287897406118 | 0.102 |
| 0.3372398154411609 | 0.372 |
| 0.2766308111639312 | 0.286 |
| 0.085337193841872 | 0.439 |
| 0.0009600660881898815 | 0.174 |
| 0.09134767003759814 | 0.63 |
| 0.2693065217292696 | 0.629 |
| 0.41230344516210116 | 0.535 |
| 0.21642696447952303 | 0.673 |
| 0.03780270868721958 | 0.39 |
| 0.24164880469711136 | 0.564 |
| 0.18445097627850948 | 0.466 |
| 0.7604053092535069 | 0.848 |
| 0.3376566355191708 | 0.486 |
| 0.23512986331596464 | 0.541 |
| 0.5332065375415038 | 0.777 |
| 0.11063873227570786 | 0.313 |
| 0.4307285397251407 | 0.531 |
| 0.09904163679817835 | 0.434 |
| 0.015460109534904287 | 0.483 |
| 0.005319630699922251 | 0.485 |
| 0.5294996660756799 | 0.86 |
| 0.03334388820291945 | 0.331 |
| 0.6945403538417547 | 0.914 |
| 0.12460841210621121 | 0.446 |
| 0.1959097497535095 | 0.38 |
| 0.15117135549201366 | 0.642 |
| 0.31422933403819775 | 0.417 |
| 0.3580527948872667 | 0.761 |
| 0.24080624931788386 | 0.315 |
| 0.5685232348912527 | 0.575 |
| 0.5493072009949386 | 0.681 |
| 0.2529790880218571 | 0.482 |
| 0.1831869853047845 | 0.342 |
| 0.12615459503892568 | 0.538 |
| 0.7161781587877027 | 0.931 |
| 0.37822899923184616 | 0.66 |
| 0.1979995500115047 | 0.429 |
| 0.08832560369444054 | 0.722 |
| 0.5661453395949632 | 0.739 |
| 0.01662156745724397 | 0.167 |
| 0.13108549203173536 | 0.156 |
| 0.164228776833372 | 0.626 |
| 0.1896498035939831 | 0.227 |
| 0.043825009519737 | 0.158 |
| 0.1504801607639743 | 0.169 |
| 0.3244434239393402 | 0.702 |
| 0.06593364335871832 | 0.447 |
| 0.43846863663855495 | 0.597 |
| 0.5787736444778833 | 0.688 |
| 0.25310116382100234 | 0.669 |
| 0.09691859069405573 | 0.803 |
| 0.5894401692029596 | 0.752 |
| 0.026580905812311317 | 0.346 |
| 0.07269930019335746 | 0.212 |
| 0.02699196302545026 | 0.166 |
| 0.45883039837756867 | 0.662 |
| 0.03150283400449316 | 0.44 |
| 0.05369665714556926 | 0.516 |
| 0.4664065548788012 | 0.776 |
| 0.16645957957018487 | 0.245 |
| 0.4881634323708993 | 0.679 |
| 0.007533460303723594 | 0.539 |
| 0.19253268802113843 | 0.326 |
| 0.07827220239957866 | 0.351 |
| 0.2645188923976599 | 0.635 |
| 0.27190074040446843 | 0.449 |
| 0.4112740438943502 | 0.934 |
| 0.020557601436945294 | 0.142 |
| 0.009846124025254865 | 0.202 |
| 0.018026738243174023 | 0.502 |
| 0.01834308384025518 | 0.046 |
| 0.1482231437693552 | 0.868 |
| 0.012232891771409848 | 0.311 |
| 0.013019920880013247 | 0.348 |
| 0.3001257715157529 | 0.838 |
| 0.30185469791662867 | 0.818 |
| 0.10660235467098056 | 0.131 |
| 0.052472777565532036 | 0.646 |
| 0.25724821085179395 | 0.259 |
| 0.40009247210079657 | 0.547 |
| 0.1315015053747851 | 0.161 |
| 0.03658618452154416 | 0.29 |
| 0.24886060528564014 | 0.822 |
| 0.016291618670128183 | 0.025 |
| 0.6381438024280074 | 0.841 |
| 0.07323778199056319 | 0.812 |
| 0.09760320058886651 | 0.519 |
| 0.07401503970774936 | 0.354 |
| 0.32268624195943174 | 0.756 |
| 0.5333927223451482 | 0.76 |
| 0.3799618119290771 | 0.408 |
| 0.050114184690637886 | 0.067 |
| 0.35725465615567253 | 0.757 |
| 0.2906595515830712 | 0.431 |
| 0.13802251628032924 | 0.422 |
| 0.26647635965408334 | 0.343 |
| 0.31862555999900044 | 0.417 |
| 0.1024495116567139 | 0.156 |
| 0.3046414421155733 | 0.619 |
| 0.03923173701653426 | 0.611 |
| 0.14804605993417852 | 0.468 |
| 0.035016492559689194 | 0.828 |
| 0.04572005911534138 | 0.077 |
| 0.1224481747277264 | 0.168 |
| 0.30709884192404746 | 0.408 |
| 0.1173601483447968 | 0.417 |
| 0.2731880194761702 | 0.545 |
| 0.07307089884066287 | 0.155 |
| 0.6831837234863998 | 0.903 |
| 0.32860560131886274 | 0.538 |
| 0.51143043417153 | 0.603 |
| 0.2784227939284689 | 0.894 |
| 0.030187181838341903 | 0.341 |
| 0.365878820892667 | 0.418 |
| 0.011826538737327308 | 0.8 |
| 0.20206224266659034 | 0.247 |
| 0.0005561338170159136 | 0.253 |
| 0.3604650328519938 | 0.673 |
| 0.06677879228483652 | 0.354 |
| 0.4345172176586305 | 0.634 |
| 0.19180467833596881 | 0.33 |
| 0.1111512922660508 | 0.447 |
| 0.46038187298177247 | 0.723 |
| 0.3662932144178008 | 0.593 |
| 0.30329731085439915 | 0.45 |
| 0.6514093376926964 | 0.827 |
| 0.06526477695938515 | 0.108 |
| 0.26942399218729673 | 0.367 |
| 0.20354441969345705 | 0.891 |
| 0.42264774542270345 | 0.627 |
| 0.25629843411072983 | 0.741 |
| 0.05879681546216564 | 0.135 |
| 0.42767499800909525 | 0.586 |
| 0.5106266585419864 | 0.723 |
| 0.15151569205507331 | 0.804 |
| 0.44871809686340525 | 0.562 |
| 0.1684096314993514 | 0.19 |
| 0.049777051573152487 | 0.104 |
| 0.6579660397802553 | 0.773 |
| 0.1655742758794716 | 0.326 |
| 0.2584926603756904 | 0.35 |
| 0.3406637733733644 | 0.471 |
| 0.26340347036044287 | 0.548 |
| 0.3227247111826256 | 0.664 |
| 0.8778585871315658 | 0.879 |
| 0.0957485780246845 | 0.392 |
| 0.010227752729258799 | 0.358 |
| 0.06836542667032164 | 0.427 |
| 0.15182693319272 | 0.242 |
| 0.1345282620810161 | 0.666 |
| 0.28724811967255204 | 0.609 |
| 0.1438148202959203 | 0.615 |
| 0.40063140537453423 | 0.511 |
| 0.006975262362723611 | 0.303 |
| 0.0696250626022562 | 0.294 |
| 0.09267573477593793 | 0.117 |
| 0.02303989614361357 | 0.423 |
| 0.330111010381544 | 0.796 |
| 0.240377090737805 | 0.44 |
| 0.30807436273788724 | 0.486 |
| 0.031038007261477762 | 0.614 |
| 0.44885893020053624 | 0.491 |
| 0.19554425505968565 | 0.733 |
| 0.3062851446148527 | 0.619 |
| 0.250280769004937 | 0.264 |
| 0.01812627137547218 | 0.051 |
| 0.0008191229762395391 | 0.587 |
| 0.2692034759837497 | 0.409 |
| 0.3982523433308299 | 0.517 |
| 0.3553314666569243 | 0.567 |
| 0.052131064108388414 | 0.43 |
| 0.03435564692311288 | 0.604 |
| 0.03155733732244248 | 0.071 |
| 0.010230277102175944 | 0.039 |
| 0.05884978240675032 | 0.397 |
| 0.057552680026102365 | 0.149 |
| 0.20531513236710597 | 0.51 |
| 0.09793813892029546 | 0.275 |
| 0.25205104891464225 | 0.616 |
| 0.022066416746660877 | 0.717 |
| 0.4232167304444765 | 0.698 |
| 0.49281511981457027 | 0.834 |
| 0.2433075365353894 | 0.63 |
| 0.2343802178159211 | 0.267 |
| 0.031210626550509768 | 0.297 |
| 0.06033879912102036 | 0.239 |
| 0.06527897636547098 | 0.312 |
| 0.14830788746376 | 0.217 |
| 0.040477255757365715 | 0.757 |
| 0.04819142773067453 | 0.613 |
| 0.02333182057668315 | 0.557 |
| 0.27213107787146407 | 0.452 |
| 0.019518751208165708 | 0.772 |
| 0.33673884058269254 | 0.651 |
| 0.38490311162791846 | 0.452 |
| 0.02740242697844042 | 0.223 |
| 0.16402873074207902 | 0.738 |
| 0.2798258664636982 | 0.857 |
| 0.24262735494772325 | 0.532 |
| 0.5988132467027294 | 0.601 |
| 0.08029939585725487 | 0.623 |
| 0.09616211817162301 | 0.61 |
| 0.03798687512237753 | 0.349 |
| 0.5691679270248036 | 0.643 |
| 0.30076824339273334 | 0.571 |
| 0.08508772236666085 | 0.867 |
| 0.020862475126692037 | 0.096 |
| 0.5463201522023176 | 0.64 |
| 0.6416863727187094 | 0.668 |
| 0.06329461106396728 | 0.212 |
| 0.403903407638068 | 0.698 |
| 0.5122036887638792 | 0.64 |
| 0.2980125540249352 | 0.627 |
| 0.1655135368048325 | 0.264 |
| 0.03239375389323307 | 0.202 |
| 0.5701353098282624 | 0.634 |
| 0.20274542479531654 | 0.257 |
| 0.19729243984369915 | 0.363 |
| 0.21374114794581356 | 0.302 |
| 0.3501511706911892 | 0.673 |
| 0.03969911767634349 | 0.711 |
| 0.12825422370504702 | 0.735 |
| 0.1426163301266994 | 0.223 |
| 0.28378602729425895 | 0.339 |
| 0.124394919199874 | 0.141 |
| 0.029783622993304726 | 0.532 |
| 0.20092075557965128 | 0.605 |
| 0.053876162626910196 | 0.148 |
| 0.17674095023177216 | 0.584 |
| 0.38094978801420165 | 0.505 |
| 0.46576122981724144 | 0.505 |
| 0.558906531747758 | 0.579 |
| 0.021272947425894362 | 0.601 |
| 0.27380700461948504 | 0.349 |
| 0.014445087369199361 | 0.357 |
| 0.21850208741229427 | 0.273 |
| 0.31973107943952894 | 0.537 |
| 0.5452068365014211 | 0.557 |
| 0.23085710255188452 | 0.412 |
| 0.09992461779496775 | 0.281 |
| 0.25350406773028267 | 0.284 |
| 0.21437125054391182 | 0.391 |
| 0.0626885312545441 | 0.179 |
| 0.2992896190921388 | 0.517 |
| 0.12364268151672841 | 0.308 |
| 0.3372320290399764 | 0.408 |
| 0.4121809237843205 | 0.588 |
| 0.28291791399978106 | 0.364 |
| 0.42818347938402956 | 0.538 |
| 0.2846019711404927 | 0.555 |
| 0.4569972005657035 | 0.548 |
| 0.24607726170766175 | 0.581 |
| 0.4330783504627126 | 0.7 |
| 0.1535180714052916 | 0.213 |
| 0.20732797843058404 | 0.315 |
| 0.9566935259258311 | 0.967 |
| 0.09604425554830354 | 0.343 |
| 0.49066887807513704 | 0.65 |
| 0.5345510423529971 | 0.866 |
| 0.5607436754847465 | 0.572 |
| 0.38477298274560756 | 0.457 |
| 0.16928225643043726 | 0.275 |
| 0.09217955875810457 | 0.329 |
| 0.35868102820850745 | 0.749 |
| 0.01740575602374994 | 0.617 |
| 0.6772115009029186 | 0.861 |
| 0.12035949732368056 | 0.743 |
| 0.1583063961892377 | 0.338 |
| 0.7315039200137184 | 0.807 |
| 0.41000273072470594 | 0.827 |
| 0.15880499277640892 | 0.477 |
| 0.24480667413140933 | 0.306 |
| 0.5889992445173945 | 0.602 |
| 0.34017764254599137 | 0.782 |
| 0.27312280385512355 | 0.68 |
| 0.4451420454960625 | 0.66 |
| 0.11368628423491722 | 0.542 |
| 0.3473254498258024 | 0.383 |
| 0.3584327074706529 | 0.751 |
| 0.2675121089102753 | 0.67 |
| 0.35341053094049746 | 0.401 |
| 0.11471486395178954 | 0.252 |
| 0.48553579462394125 | 0.713 |
| 0.08787498410733285 | 0.698 |
| 0.0036423665508171776 | 0.061 |
| 0.3976432694544776 | 0.779 |
| 0.13315115387654375 | 0.651 |
| 0.07100090357645983 | 0.346 |
| 0.024375909038055643 | 0.358 |
| 0.14511669499821067 | 0.301 |
| 0.7664243300600103 | 0.811 |
| 0.06637067236148697 | 0.237 |
| 0.12496810938625191 | 0.164 |
| 0.4241674351904875 | 0.696 |
| 0.21043805249305003 | 0.463 |
| 0.32381040071513223 | 0.718 |
| 0.0215549883694105 | 0.328 |
| 0.5557459852087262 | 0.634 |
| 0.054422989976381175 | 0.483 |
| 0.0012542404416892028 | 0.872 |
| 0.4194185688770615 | 0.457 |
| 0.06364707187713514 | 0.288 |
| 0.04455978753791223 | 0.173 |
| 0.38795894440225087 | 0.474 |
| 0.06006801857126054 | 0.248 |
| 0.16881336272238578 | 0.177 |
| 0.21657495846096664 | 0.458 |
| 0.15263567115900134 | 0.39 |
| 0.13728690994563408 | 0.342 |
| 0.07771357160681203 | 0.684 |
| 0.09746808946736363 | 0.1 |
| 0.4303815240124349 | 0.544 |
| 0.3523855301677179 | 0.374 |
| 0.3308008705301029 | 0.632 |
| 0.09199754040796349 | 0.408 |
| 0.06725885226214368 | 0.411 |
| 0.07682244038157182 | 0.932 |
| 0.31852192948806424 | 0.653 |
| 0.0642556487361221 | 0.249 |
| 0.4701203608151787 | 0.836 |
| 0.17055780481670146 | 0.444 |
| 0.09928220881954886 | 0.497 |
| 0.34042974708440277 | 0.577 |
| 0.1752615271894694 | 0.687 |
| 0.025534875625134568 | 0.785 |
| 0.20431469786444256 | 0.758 |
| 0.42465967536604865 | 0.593 |
| 0.3232986347690937 | 0.438 |
| 0.17249326346788374 | 0.743 |
| 0.7987908017874678 | 0.938 |
| 0.6628719651434067 | 0.798 |
| 0.1354713218325293 | 0.172 |
| 0.25154862168170666 | 0.398 |
| 0.2704543426304534 | 0.631 |
| 0.28791772266201066 | 0.36 |
| 0.7064341276191203 | 0.796 |
| 0.40841550377426317 | 0.762 |
| 0.17725895011554083 | 0.482 |
| 0.14253300175895278 | 0.481 |
| 0.38718832332462993 | 0.508 |
| 0.5287472003398879 | 0.718 |
| 0.2828263787344204 | 0.601 |
| 0.0362567073729384 | 0.149 |
| 0.15257916150715933 | 0.815 |
| 0.1905081692958721 | 0.369 |
| 0.3274701567710727 | 0.422 |
| 0.006964851717133014 | 0.334 |
| 0.1477313309548003 | 0.315 |
| 0.009412028173285791 | 0.017 |
| 0.22128563936615286 | 0.778 |
| 0.5293376857816549 | 0.883 |
| 0.24751736912180888 | 0.427 |
| 0.6329265752343061 | 0.635 |
| 0.24945649031130468 | 0.414 |
| 0.14704685236770199 | 0.74 |
| 0.24724510458650373 | 0.836 |
| 0.17625197371385537 | 0.254 |
| 0.5036516472307191 | 0.622 |
| 0.13380913200992617 | 0.139 |
| 0.33263531439653116 | 0.73 |
| 0.6195651565840803 | 0.668 |
| 0.6525914209447211 | 0.896 |
| 0.09309064787949439 | 0.548 |
| 0.4321348979158367 | 0.667 |
| 0.3351947199390485 | 0.949 |
| 0.6026517783914049 | 0.608 |
| 0.5661187874900065 | 0.866 |
| 0.2382517473911503 | 0.471 |
| 0.06570438281198077 | 0.581 |
| 0.5689654778754004 | 0.734 |
| 0.19700544528406538 | 0.462 |
| 0.17370559992658796 | 0.209 |
| 0.014554151417504824 | 0.221 |
| 0.21515137095241554 | 0.255 |
| 0.11533974699671035 | 0.478 |
| 0.3466781853858014 | 0.864 |
| 0.6745178558181344 | 0.906 |
| 0.2682361203604634 | 0.542 |
| 0.5688439556423005 | 0.656 |
| 0.15425457105176232 | 0.665 |
| 0.09458319120918313 | 0.571 |
| 0.058359163929663116 | 0.322 |
| 0.45220606808742714 | 0.461 |
| 0.041693160809475716 | 0.445 |
| 0.0648573015841184 | 0.069 |
| 0.4301533866001781 | 0.625 |
| 0.054433999692772406 | 0.184 |
| 0.26533689628892954 | 0.389 |
| 0.5072735691536661 | 0.862 |
| 0.24206402627581902 | 0.464 |
| 0.4462345866678622 | 0.707 |
| 0.3047618385712043 | 0.48 |
| 0.12616407070132973 | 0.643 |
| 0.46510431572671496 | 0.531 |
| 0.07058601370054352 | 0.139 |
| 0.3936686684972852 | 0.626 |
| 0.04141311793479929 | 0.184 |
| 0.34057055817362336 | 0.63 |
| 0.04306183461876911 | 0.849 |
| 0.31658697620619614 | 0.445 |
| 0.10356014590674179 | 0.211 |
| 0.31371178948840805 | 0.882 |
| 0.0995880823258678 | 0.524 |
| 0.21243398207604847 | 0.438 |
| 0.029277603653248163 | 0.066 |
| 0.2159703944400614 | 0.237 |
| 0.29028998014953555 | 0.326 |
| 0.1277053963123842 | 0.149 |
| 0.3653571659561209 | 0.462 |
| 0.036630923403002 | 0.252 |
| 0.37844360547591416 | 0.488 |
| 0.2521283069409509 | 0.446 |
| 0.24551721374210178 | 0.395 |
| 0.22985482632416743 | 0.621 |
| 0.5259508442461162 | 0.925 |
| 0.19905612499669112 | 0.462 |
| 0.3605695890095161 | 0.878 |
| 0.23491890877578014 | 0.799 |
| 0.5278366940276307 | 0.737 |
| 0.14245880382932796 | 0.184 |
| 0.24983223177777214 | 0.41 |
| 0.014842421096605274 | 0.142 |
| 0.3627810979899123 | 0.567 |
| 0.4636171791503433 | 0.786 |
| 0.03971083722160329 | 0.101 |
| 0.1276125374375956 | 0.285 |
| 0.28644680617618656 | 0.729 |
| 0.020510365861076685 | 0.12 |
| 0.3989338048363771 | 0.603 |
| 0.10629663807063039 | 0.124 |
| 0.10854373224074998 | 0.258 |
| 0.5987658626635146 | 0.784 |
| 0.15640922295689175 | 0.464 |
| 0.5223544003594875 | 0.742 |
| 0.6283818024783353 | 0.732 |
| 0.28920020551884285 | 0.545 |
| 0.26177449197926506 | 0.576 |
| 0.15689482479456973 | 0.256 |
| 0.23662543334046915 | 0.417 |
| 0.051008586055110605 | 0.494 |
| 0.3884606216859674 | 0.651 |
| 0.14278108086488006 | 0.319 |
| 0.4613172357046681 | 0.817 |
| 0.26373856320454614 | 0.575 |
| 0.11085100142578286 | 0.345 |
| 0.4736248534368306 | 0.581 |
| 0.7888168191542062 | 0.828 |
| 0.1495368198060819 | 0.676 |
| 0.24963570935232193 | 0.332 |
| 0.17960933358060704 | 0.639 |
| 0.17011621841972036 | 0.555 |
| 0.04457692394195245 | 0.226 |
| 0.5157636482157646 | 0.762 |
| 0.035422312009486534 | 0.316 |
| 0.17347363055868192 | 0.344 |
| 0.25558002113266487 | 0.319 |
| 0.026720580954696427 | 0.481 |
| 0.09998115652573425 | 0.411 |
| 0.41796604365764467 | 0.736 |
| 0.13898907231890967 | 0.16 |
| 0.31677751367183715 | 0.488 |
| 0.5885691749031641 | 0.802 |
| 0.30555977006533086 | 0.496 |
| 0.21059767358535686 | 0.559 |
| 0.11436385910382751 | 0.424 |
| 0.07302121165978737 | 0.268 |
| 0.446548436110784 | 0.515 |
| 0.9330014601070826 | 0.961 |
| 0.009169939351486689 | 0.174 |
| 0.34073926206641325 | 0.785 |
| 0.11161639284709923 | 0.127 |
| 0.06676675454630832 | 0.28 |
| 0.120166568507724 | 0.487 |
| 0.4950824699274645 | 0.584 |
| 0.4048560063519555 | 0.432 |
| 0.0014811596214201472 | 0.155 |
| 0.3912842717970675 | 0.43 |
| 0.10795221939715138 | 0.149 |
| 0.17691085538366114 | 0.22 |
| 0.5543345632863002 | 0.657 |
| 0.11750941530182801 | 0.43 |
| 0.5081058830092632 | 0.871 |
| 0.24953481624380025 | 0.379 |
| 0.4628997427601622 | 0.695 |
| 0.5144929939180181 | 0.873 |
| 0.26502698801353053 | 0.851 |
| 0.25891247831919084 | 0.355 |
| 0.359652249693033 | 0.41 |
| 0.1567615437582245 | 0.375 |
| 0.2984451025255771 | 0.507 |
| 0.16487243566034726 | 0.286 |
| 0.017045727889532847 | 0.69 |
| 0.0589436717007098 | 0.2 |
| 0.5330849816964432 | 0.826 |
| 0.30663980130336776 | 0.398 |
| 0.5761516018907503 | 0.809 |
| 0.4685575955361828 | 0.512 |
| 0.29100892275650214 | 0.602 |
| 0.016389398964543833 | 0.844 |
| 0.054744826584423256 | 0.17 |
| 0.5887248884012073 | 0.667 |
| 0.03994764230410819 | 0.137 |
| 0.06998948369081737 | 0.427 |
| 0.11230243286049146 | 0.69 |
| 0.02813319578478024 | 0.087 |
| 0.30223068260315267 | 0.386 |
| 0.05760247798283524 | 0.459 |
| 0.4206031206453449 | 0.465 |
| 0.06746685008557263 | 0.816 |
| 0.10042200110013078 | 0.104 |
| 0.5899485824535456 | 0.727 |
| 0.14164340575586898 | 0.326 |
| 0.6051842867425825 | 0.609 |
| 0.02914036065762815 | 0.906 |
| 0.36504610737286514 | 0.544 |
| 0.05166754605395907 | 0.092 |
| 0.04294081664924687 | 0.789 |
| 0.42400760527831793 | 0.685 |
| 0.02522324303729384 | 0.106 |
| 0.05029376013825004 | 0.159 |
| 0.7112839831765323 | 0.913 |
| 0.7528595059313353 | 0.863 |
| 0.3981557321750858 | 0.534 |
| 0.17977585845145916 | 0.239 |
| 0.060372205022237835 | 0.787 |
| 0.16338497288115295 | 0.417 |
| 0.13319350624895043 | 0.377 |
| 0.4913416519710757 | 0.618 |
| 0.20149685818112884 | 0.428 |
| 0.09510972924809846 | 0.468 |
| 0.1761582304677748 | 0.855 |
| 0.1068250711297396 | 0.333 |
| 0.29452272079967745 | 0.79 |
| 0.2309699361249289 | 0.463 |
| 0.21952821982180892 | 0.919 |
| 0.46676039008119263 | 0.56 |
| 0.13370794344282488 | 0.376 |
| 0.0011092699642055726 | 0.499 |
| 0.13088464760923002 | 0.298 |
| 0.28392893554721066 | 0.856 |
| 0.5315263277964294 | 0.803 |
| 0.2128449847836349 | 0.613 |
| 0.3274966473370906 | 0.505 |
| 0.8089697327500035 | 0.817 |
| 0.18679479514252406 | 0.736 |
| 0.3966080978467732 | 0.508 |
| 0.04689810493801316 | 0.366 |
| 0.618990545276879 | 0.715 |
| 0.1473764300421867 | 0.484 |
| 0.3767040878621032 | 0.422 |
| 0.4276172750355669 | 0.567 |
| 0.36700734633827325 | 0.537 |
| 0.04215852118054075 | 0.386 |
| 0.3288405874662489 | 0.739 |
| 0.39952391088348926 | 0.572 |
| 0.2658498567171679 | 0.313 |
| 0.011245545919184807 | 0.088 |
| 0.24562644795408983 | 0.253 |
| 0.0018271252337048738 | 0.162 |
| 0.026219624754330595 | 0.779 |
| 0.05625372279160301 | 0.073 |
| 0.28218918850416874 | 0.326 |
| 0.4463063925353311 | 0.682 |
| 0.12467604713103442 | 0.466 |
| 0.0756087677127264 | 0.556 |
| 0.2862736157131708 | 0.584 |
| 0.20693589109058397 | 0.343 |
| 0.2890888999920884 | 0.975 |
| 0.23242629706157547 | 0.553 |
| 0.12076918493637545 | 0.635 |
| 0.21006227113957443 | 0.256 |
| 0.24160020520582504 | 0.417 |
| 0.3518772131885908 | 0.463 |
| 0.22297985674604026 | 0.67 |
| 0.66650756428418 | 0.829 |
| 0.02004683860708867 | 0.423 |
| 0.09174700069356867 | 0.313 |
| 0.2856102828862743 | 0.372 |
| 0.3223058556360564 | 0.334 |
| 0.328333561801167 | 0.421 |
| 0.053335632216806594 | 0.409 |
| 0.23721742932913015 | 0.531 |
| 0.4891408277016752 | 0.926 |
| 0.1371006274764791 | 0.23 |
| 0.20934864586241353 | 0.655 |
| 0.0068243649591306355 | 0.374 |
| 0.6706157174395503 | 0.868 |
| 0.029308212637245257 | 0.085 |
| 0.15684282994069798 | 0.449 |
| 0.1990577622070181 | 0.21 |
| 0.2161188546501256 | 0.316 |
| 0.08134422240200445 | 0.095 |
| 0.22950927061878734 | 0.34 |
| 0.10231123616703064 | 0.168 |
| 0.6007748997154456 | 0.716 |
| 0.23115182746727803 | 0.238 |
| 0.24101709803431737 | 0.48 |
| 0.35945423929470277 | 0.508 |
| 0.07309414829927485 | 0.29 |
| 0.027057443685269966 | 0.478 |
| 0.0625757619937859 | 0.064 |
| 0.5608808566159577 | 0.619 |
| 0.3733399863099628 | 0.452 |
| 0.1359038432849493 | 0.264 |
| 0.37572219966870146 | 0.61 |
| 0.566092463085081 | 0.65 |
| 0.25646308749082214 | 0.354 |
| 0.2841606276043175 | 0.583 |
| 0.5778959892455264 | 0.672 |
| 0.01873127571743105 | 0.047 |
| 0.17786650026620232 | 0.551 |
| 0.010033473306504614 | 0.012 |
| 0.5785031521312528 | 0.71 |
| 0.05342837075967877 | 0.775 |
| 0.012537366459895782 | 0.477 |
| 0.5330535591803282 | 0.811 |
| 0.43123978915578365 | 0.522 |
| 0.27933332401649036 | 0.579 |
| 0.4799916396930054 | 0.6 |
| 0.5028409003902239 | 0.816 |
| 0.23126260120616027 | 0.314 |
| 0.11052202271819223 | 0.748 |
| 0.03190510150349701 | 0.695 |
| 0.2690597577904661 | 0.37 |
| 0.18621931246904122 | 0.533 |
| 0.4937127804769613 | 0.705 |
| 0.47431647425700973 | 0.726 |
| 0.23194999932912108 | 0.445 |
| 0.009993250085192473 | 0.511 |
| 0.2656684831994933 | 0.836 |
| 0.02984607566869335 | 0.858 |
| 0.5375154280520092 | 0.753 |
| 0.2981991304053855 | 0.712 |
| 0.19767568752506137 | 0.966 |
| 0.47281221184744215 | 0.599 |
| 0.18051798558808285 | 0.623 |
| 0.6397865889570993 | 0.788 |
| 0.024823823136542855 | 0.079 |
| 0.15035994602067926 | 0.415 |
| 0.24318043124529187 | 0.591 |
| 0.11726573733458279 | 0.584 |
| 0.2969725484504788 | 0.516 |
| 0.11308159569714371 | 0.261 |
| 0.13900809898268873 | 0.397 |
| 0.12946806936631672 | 0.542 |
| 0.39788191496331804 | 0.808 |
| 0.007311567925266438 | 0.491 |
| 0.6043433669309619 | 0.797 |
| 0.07497907260071435 | 0.712 |
| 0.09941203270581667 | 0.625 |
| 0.1280927627260523 | 0.424 |
| 0.31827477335292087 | 0.808 |
| 0.41351621734317445 | 0.588 |
| 0.0534318546906154 | 0.495 |
| 0.4823724461957619 | 0.661 |
| 0.23175518759896807 | 0.635 |
| 0.38828831373091444 | 0.825 |
| 0.14008099804904262 | 0.482 |
| 0.25984785853964765 | 0.594 |
| 0.39605128115364696 | 0.942 |
| 0.0787401811321734 | 0.238 |
| 0.34096457290025806 | 0.461 |
| 0.30701904045693473 | 0.385 |
| 0.30923121363319384 | 0.817 |
| 0.06105366920263344 | 0.135 |
| 0.14771390209709745 | 0.296 |
| 0.21229547752622102 | 0.242 |
| 0.29932362440582494 | 0.507 |
| 0.11298377659250902 | 0.59 |
| 0.29818487023180806 | 0.683 |
| 0.5891030178610833 | 0.655 |
| 0.5385565584901018 | 0.703 |
| 0.28687880838800284 | 0.625 |
| 0.5751294597354568 | 0.64 |
| 0.043522538738153704 | 0.833 |
| 0.030051174858414242 | 0.102 |
| 0.23303388259206848 | 0.235 |
| 0.30473286321668613 | 0.472 |
| 0.925699849778938 | 0.934 |
| 0.3223034990200292 | 0.524 |
| 0.195497490981826 | 0.85 |
| 0.32251917581893597 | 0.436 |
| 0.3272375581703575 | 0.384 |
| 0.009078754009303025 | 0.261 |